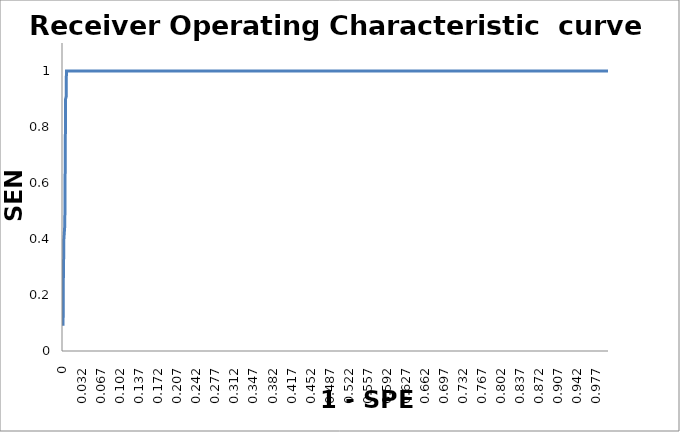
| Category | SEN |
|---|---|
| 0.0 | 0.09 |
| 0.0 | 0.18 |
| 0.0 | 0.27 |
| 0.0 | 0.3 |
| 0.0 | 0.36 |
| 0.0010000000000000009 | 0.4 |
| 0.0010000000000000009 | 0.4 |
| 0.0010000000000000009 | 0.4 |
| 0.0010000000000000009 | 0.4 |
| 0.0020000000000000018 | 0.4 |
| 0.0020000000000000018 | 0.4 |
| 0.0020000000000000018 | 0.45 |
| 0.0020000000000000018 | 0.55 |
| 0.0020000000000000018 | 0.64 |
| 0.0020000000000000018 | 0.73 |
| 0.0020000000000000018 | 0.82 |
| 0.0020000000000000018 | 0.9 |
| 0.0030000000000000027 | 0.9 |
| 0.0030000000000000027 | 0.9 |
| 0.0030000000000000027 | 0.9 |
| 0.0030000000000000027 | 0.91 |
| 0.0030000000000000027 | 1 |
| 0.0040000000000000036 | 1 |
| 0.0040000000000000036 | 1 |
| 0.0040000000000000036 | 1 |
| 0.0050000000000000044 | 1 |
| 0.0050000000000000044 | 1 |
| 0.0050000000000000044 | 1 |
| 0.006000000000000005 | 1 |
| 0.006000000000000005 | 1 |
| 0.006000000000000005 | 1 |
| 0.006000000000000005 | 1 |
| 0.007000000000000006 | 1 |
| 0.007000000000000006 | 1 |
| 0.007000000000000006 | 1 |
| 0.008000000000000007 | 1 |
| 0.008000000000000007 | 1 |
| 0.008000000000000007 | 1 |
| 0.008000000000000007 | 1 |
| 0.009000000000000008 | 1 |
| 0.009000000000000008 | 1 |
| 0.009000000000000008 | 1 |
| 0.010000000000000009 | 1 |
| 0.010000000000000009 | 1 |
| 0.010000000000000009 | 1 |
| 0.010000000000000009 | 1 |
| 0.01100000000000001 | 1 |
| 0.01100000000000001 | 1 |
| 0.01100000000000001 | 1 |
| 0.01200000000000001 | 1 |
| 0.01200000000000001 | 1 |
| 0.01200000000000001 | 1 |
| 0.013000000000000012 | 1 |
| 0.013000000000000012 | 1 |
| 0.013000000000000012 | 1 |
| 0.013000000000000012 | 1 |
| 0.014000000000000012 | 1 |
| 0.014000000000000012 | 1 |
| 0.014000000000000012 | 1 |
| 0.015000000000000013 | 1 |
| 0.015000000000000013 | 1 |
| 0.015000000000000013 | 1 |
| 0.015000000000000013 | 1 |
| 0.016000000000000014 | 1 |
| 0.016000000000000014 | 1 |
| 0.016000000000000014 | 1 |
| 0.017000000000000015 | 1 |
| 0.017000000000000015 | 1 |
| 0.017000000000000015 | 1 |
| 0.017000000000000015 | 1 |
| 0.018000000000000016 | 1 |
| 0.018000000000000016 | 1 |
| 0.018000000000000016 | 1 |
| 0.019000000000000017 | 1 |
| 0.019000000000000017 | 1 |
| 0.019000000000000017 | 1 |
| 0.020000000000000018 | 1 |
| 0.020000000000000018 | 1 |
| 0.020000000000000018 | 1 |
| 0.020000000000000018 | 1 |
| 0.02100000000000002 | 1 |
| 0.02100000000000002 | 1 |
| 0.02100000000000002 | 1 |
| 0.02200000000000002 | 1 |
| 0.02200000000000002 | 1 |
| 0.02200000000000002 | 1 |
| 0.02200000000000002 | 1 |
| 0.02300000000000002 | 1 |
| 0.02300000000000002 | 1 |
| 0.02300000000000002 | 1 |
| 0.02400000000000002 | 1 |
| 0.02400000000000002 | 1 |
| 0.02400000000000002 | 1 |
| 0.02400000000000002 | 1 |
| 0.025000000000000022 | 1 |
| 0.025000000000000022 | 1 |
| 0.025000000000000022 | 1 |
| 0.026000000000000023 | 1 |
| 0.026000000000000023 | 1 |
| 0.026000000000000023 | 1 |
| 0.027000000000000024 | 1 |
| 0.027000000000000024 | 1 |
| 0.027000000000000024 | 1 |
| 0.027000000000000024 | 1 |
| 0.028000000000000025 | 1 |
| 0.028000000000000025 | 1 |
| 0.028000000000000025 | 1 |
| 0.029000000000000026 | 1 |
| 0.029000000000000026 | 1 |
| 0.029000000000000026 | 1 |
| 0.029000000000000026 | 1 |
| 0.030000000000000027 | 1 |
| 0.030000000000000027 | 1 |
| 0.030000000000000027 | 1 |
| 0.031000000000000028 | 1 |
| 0.031000000000000028 | 1 |
| 0.031000000000000028 | 1 |
| 0.031000000000000028 | 1 |
| 0.03200000000000003 | 1 |
| 0.03200000000000003 | 1 |
| 0.03200000000000003 | 1 |
| 0.03300000000000003 | 1 |
| 0.03300000000000003 | 1 |
| 0.03300000000000003 | 1 |
| 0.03400000000000003 | 1 |
| 0.03400000000000003 | 1 |
| 0.03400000000000003 | 1 |
| 0.03400000000000003 | 1 |
| 0.03500000000000003 | 1 |
| 0.03500000000000003 | 1 |
| 0.03500000000000003 | 1 |
| 0.03600000000000003 | 1 |
| 0.03600000000000003 | 1 |
| 0.03600000000000003 | 1 |
| 0.03600000000000003 | 1 |
| 0.03700000000000003 | 1 |
| 0.03700000000000003 | 1 |
| 0.03700000000000003 | 1 |
| 0.038000000000000034 | 1 |
| 0.038000000000000034 | 1 |
| 0.038000000000000034 | 1 |
| 0.038000000000000034 | 1 |
| 0.039000000000000035 | 1 |
| 0.039000000000000035 | 1 |
| 0.039000000000000035 | 1 |
| 0.040000000000000036 | 1 |
| 0.040000000000000036 | 1 |
| 0.040000000000000036 | 1 |
| 0.041000000000000036 | 1 |
| 0.041000000000000036 | 1 |
| 0.041000000000000036 | 1 |
| 0.041000000000000036 | 1 |
| 0.04200000000000004 | 1 |
| 0.04200000000000004 | 1 |
| 0.04200000000000004 | 1 |
| 0.04300000000000004 | 1 |
| 0.04300000000000004 | 1 |
| 0.04300000000000004 | 1 |
| 0.04300000000000004 | 1 |
| 0.04400000000000004 | 1 |
| 0.04400000000000004 | 1 |
| 0.04400000000000004 | 1 |
| 0.04500000000000004 | 1 |
| 0.04500000000000004 | 1 |
| 0.04500000000000004 | 1 |
| 0.04500000000000004 | 1 |
| 0.04600000000000004 | 1 |
| 0.04600000000000004 | 1 |
| 0.04600000000000004 | 1 |
| 0.04700000000000004 | 1 |
| 0.04700000000000004 | 1 |
| 0.04700000000000004 | 1 |
| 0.04800000000000004 | 1 |
| 0.04800000000000004 | 1 |
| 0.04800000000000004 | 1 |
| 0.04800000000000004 | 1 |
| 0.049000000000000044 | 1 |
| 0.049000000000000044 | 1 |
| 0.049000000000000044 | 1 |
| 0.050000000000000044 | 1 |
| 0.050000000000000044 | 1 |
| 0.050000000000000044 | 1 |
| 0.050000000000000044 | 1 |
| 0.051000000000000045 | 1 |
| 0.051000000000000045 | 1 |
| 0.051000000000000045 | 1 |
| 0.052000000000000046 | 1 |
| 0.052000000000000046 | 1 |
| 0.052000000000000046 | 1 |
| 0.052000000000000046 | 1 |
| 0.05300000000000005 | 1 |
| 0.05300000000000005 | 1 |
| 0.05300000000000005 | 1 |
| 0.05400000000000005 | 1 |
| 0.05400000000000005 | 1 |
| 0.05400000000000005 | 1 |
| 0.05500000000000005 | 1 |
| 0.05500000000000005 | 1 |
| 0.05500000000000005 | 1 |
| 0.05500000000000005 | 1 |
| 0.05600000000000005 | 1 |
| 0.05600000000000005 | 1 |
| 0.05600000000000005 | 1 |
| 0.05700000000000005 | 1 |
| 0.05700000000000005 | 1 |
| 0.05700000000000005 | 1 |
| 0.05700000000000005 | 1 |
| 0.05800000000000005 | 1 |
| 0.05800000000000005 | 1 |
| 0.05800000000000005 | 1 |
| 0.05900000000000005 | 1 |
| 0.05900000000000005 | 1 |
| 0.05900000000000005 | 1 |
| 0.05900000000000005 | 1 |
| 0.06000000000000005 | 1 |
| 0.06000000000000005 | 1 |
| 0.06000000000000005 | 1 |
| 0.061000000000000054 | 1 |
| 0.061000000000000054 | 1 |
| 0.061000000000000054 | 1 |
| 0.061000000000000054 | 1 |
| 0.062000000000000055 | 1 |
| 0.062000000000000055 | 1 |
| 0.062000000000000055 | 1 |
| 0.06299999999999994 | 1 |
| 0.06299999999999994 | 1 |
| 0.06299999999999994 | 1 |
| 0.06399999999999995 | 1 |
| 0.06399999999999995 | 1 |
| 0.06399999999999995 | 1 |
| 0.06399999999999995 | 1 |
| 0.06499999999999995 | 1 |
| 0.06499999999999995 | 1 |
| 0.06499999999999995 | 1 |
| 0.06599999999999995 | 1 |
| 0.06599999999999995 | 1 |
| 0.06599999999999995 | 1 |
| 0.06599999999999995 | 1 |
| 0.06699999999999995 | 1 |
| 0.06699999999999995 | 1 |
| 0.06699999999999995 | 1 |
| 0.06799999999999995 | 1 |
| 0.06799999999999995 | 1 |
| 0.06799999999999995 | 1 |
| 0.06799999999999995 | 1 |
| 0.06899999999999995 | 1 |
| 0.06899999999999995 | 1 |
| 0.06899999999999995 | 1 |
| 0.06999999999999995 | 1 |
| 0.06999999999999995 | 1 |
| 0.06999999999999995 | 1 |
| 0.07099999999999995 | 1 |
| 0.07099999999999995 | 1 |
| 0.07099999999999995 | 1 |
| 0.07099999999999995 | 1 |
| 0.07199999999999995 | 1 |
| 0.07199999999999995 | 1 |
| 0.07199999999999995 | 1 |
| 0.07299999999999995 | 1 |
| 0.07299999999999995 | 1 |
| 0.07299999999999995 | 1 |
| 0.07299999999999995 | 1 |
| 0.07399999999999995 | 1 |
| 0.07399999999999995 | 1 |
| 0.07399999999999995 | 1 |
| 0.07499999999999996 | 1 |
| 0.07499999999999996 | 1 |
| 0.07499999999999996 | 1 |
| 0.07499999999999996 | 1 |
| 0.07599999999999996 | 1 |
| 0.07599999999999996 | 1 |
| 0.07599999999999996 | 1 |
| 0.07699999999999996 | 1 |
| 0.07699999999999996 | 1 |
| 0.07699999999999996 | 1 |
| 0.07799999999999996 | 1 |
| 0.07799999999999996 | 1 |
| 0.07799999999999996 | 1 |
| 0.07799999999999996 | 1 |
| 0.07899999999999996 | 1 |
| 0.07899999999999996 | 1 |
| 0.07899999999999996 | 1 |
| 0.07999999999999996 | 1 |
| 0.07999999999999996 | 1 |
| 0.07999999999999996 | 1 |
| 0.07999999999999996 | 1 |
| 0.08099999999999996 | 1 |
| 0.08099999999999996 | 1 |
| 0.08099999999999996 | 1 |
| 0.08199999999999996 | 1 |
| 0.08199999999999996 | 1 |
| 0.08199999999999996 | 1 |
| 0.08199999999999996 | 1 |
| 0.08299999999999996 | 1 |
| 0.08299999999999996 | 1 |
| 0.08299999999999996 | 1 |
| 0.08399999999999996 | 1 |
| 0.08399999999999996 | 1 |
| 0.08399999999999996 | 1 |
| 0.08499999999999996 | 1 |
| 0.08499999999999996 | 1 |
| 0.08499999999999996 | 1 |
| 0.08499999999999996 | 1 |
| 0.08599999999999997 | 1 |
| 0.08599999999999997 | 1 |
| 0.08599999999999997 | 1 |
| 0.08699999999999997 | 1 |
| 0.08699999999999997 | 1 |
| 0.08699999999999997 | 1 |
| 0.08699999999999997 | 1 |
| 0.08799999999999997 | 1 |
| 0.08799999999999997 | 1 |
| 0.08799999999999997 | 1 |
| 0.08899999999999997 | 1 |
| 0.08899999999999997 | 1 |
| 0.08899999999999997 | 1 |
| 0.08899999999999997 | 1 |
| 0.08999999999999997 | 1 |
| 0.08999999999999997 | 1 |
| 0.08999999999999997 | 1 |
| 0.09099999999999997 | 1 |
| 0.09099999999999997 | 1 |
| 0.09099999999999997 | 1 |
| 0.09199999999999997 | 1 |
| 0.09199999999999997 | 1 |
| 0.09199999999999997 | 1 |
| 0.09199999999999997 | 1 |
| 0.09299999999999997 | 1 |
| 0.09299999999999997 | 1 |
| 0.09299999999999997 | 1 |
| 0.09399999999999997 | 1 |
| 0.09399999999999997 | 1 |
| 0.09399999999999997 | 1 |
| 0.09399999999999997 | 1 |
| 0.09499999999999997 | 1 |
| 0.09499999999999997 | 1 |
| 0.09499999999999997 | 1 |
| 0.09599999999999997 | 1 |
| 0.09599999999999997 | 1 |
| 0.09599999999999997 | 1 |
| 0.09599999999999997 | 1 |
| 0.09699999999999998 | 1 |
| 0.09699999999999998 | 1 |
| 0.09699999999999998 | 1 |
| 0.09799999999999998 | 1 |
| 0.09799999999999998 | 1 |
| 0.09799999999999998 | 1 |
| 0.09899999999999998 | 1 |
| 0.09899999999999998 | 1 |
| 0.09899999999999998 | 1 |
| 0.09899999999999998 | 1 |
| 0.09999999999999998 | 1 |
| 0.09999999999999998 | 1 |
| 0.09999999999999998 | 1 |
| 0.10099999999999998 | 1 |
| 0.10099999999999998 | 1 |
| 0.10099999999999998 | 1 |
| 0.10099999999999998 | 1 |
| 0.10199999999999998 | 1 |
| 0.10199999999999998 | 1 |
| 0.10199999999999998 | 1 |
| 0.10299999999999998 | 1 |
| 0.10299999999999998 | 1 |
| 0.10299999999999998 | 1 |
| 0.10299999999999998 | 1 |
| 0.10399999999999998 | 1 |
| 0.10399999999999998 | 1 |
| 0.10399999999999998 | 1 |
| 0.10499999999999998 | 1 |
| 0.10499999999999998 | 1 |
| 0.10499999999999998 | 1 |
| 0.10599999999999998 | 1 |
| 0.10599999999999998 | 1 |
| 0.10599999999999998 | 1 |
| 0.10599999999999998 | 1 |
| 0.10699999999999998 | 1 |
| 0.10699999999999998 | 1 |
| 0.10699999999999998 | 1 |
| 0.10799999999999998 | 1 |
| 0.10799999999999998 | 1 |
| 0.10799999999999998 | 1 |
| 0.10799999999999998 | 1 |
| 0.10899999999999999 | 1 |
| 0.10899999999999999 | 1 |
| 0.10899999999999999 | 1 |
| 0.10999999999999999 | 1 |
| 0.10999999999999999 | 1 |
| 0.10999999999999999 | 1 |
| 0.10999999999999999 | 1 |
| 0.11099999999999999 | 1 |
| 0.11099999999999999 | 1 |
| 0.11099999999999999 | 1 |
| 0.11199999999999999 | 1 |
| 0.11199999999999999 | 1 |
| 0.11199999999999999 | 1 |
| 0.11299999999999999 | 1 |
| 0.11299999999999999 | 1 |
| 0.11299999999999999 | 1 |
| 0.11299999999999999 | 1 |
| 0.11399999999999999 | 1 |
| 0.11399999999999999 | 1 |
| 0.11399999999999999 | 1 |
| 0.11499999999999999 | 1 |
| 0.11499999999999999 | 1 |
| 0.11499999999999999 | 1 |
| 0.11499999999999999 | 1 |
| 0.11599999999999999 | 1 |
| 0.11599999999999999 | 1 |
| 0.11599999999999999 | 1 |
| 0.11699999999999999 | 1 |
| 0.11699999999999999 | 1 |
| 0.11699999999999999 | 1 |
| 0.11699999999999999 | 1 |
| 0.118 | 1 |
| 0.118 | 1 |
| 0.118 | 1 |
| 0.119 | 1 |
| 0.119 | 1 |
| 0.119 | 1 |
| 0.119 | 1 |
| 0.12 | 1 |
| 0.12 | 1 |
| 0.12 | 1 |
| 0.121 | 1 |
| 0.121 | 1 |
| 0.121 | 1 |
| 0.122 | 1 |
| 0.122 | 1 |
| 0.122 | 1 |
| 0.122 | 1 |
| 0.123 | 1 |
| 0.123 | 1 |
| 0.123 | 1 |
| 0.124 | 1 |
| 0.124 | 1 |
| 0.124 | 1 |
| 0.124 | 1 |
| 0.125 | 1 |
| 0.125 | 1 |
| 0.125 | 1 |
| 0.126 | 1 |
| 0.126 | 1 |
| 0.126 | 1 |
| 0.126 | 1 |
| 0.127 | 1 |
| 0.127 | 1 |
| 0.127 | 1 |
| 0.128 | 1 |
| 0.128 | 1 |
| 0.128 | 1 |
| 0.129 | 1 |
| 0.129 | 1 |
| 0.129 | 1 |
| 0.129 | 1 |
| 0.13 | 1 |
| 0.13 | 1 |
| 0.13 | 1 |
| 0.131 | 1 |
| 0.131 | 1 |
| 0.131 | 1 |
| 0.131 | 1 |
| 0.132 | 1 |
| 0.132 | 1 |
| 0.132 | 1 |
| 0.133 | 1 |
| 0.133 | 1 |
| 0.133 | 1 |
| 0.133 | 1 |
| 0.134 | 1 |
| 0.134 | 1 |
| 0.134 | 1 |
| 0.135 | 1 |
| 0.135 | 1 |
| 0.135 | 1 |
| 0.136 | 1 |
| 0.136 | 1 |
| 0.136 | 1 |
| 0.136 | 1 |
| 0.137 | 1 |
| 0.137 | 1 |
| 0.137 | 1 |
| 0.138 | 1 |
| 0.138 | 1 |
| 0.138 | 1 |
| 0.138 | 1 |
| 0.139 | 1 |
| 0.139 | 1 |
| 0.139 | 1 |
| 0.14 | 1 |
| 0.14 | 1 |
| 0.14 | 1 |
| 0.14 | 1 |
| 0.14100000000000001 | 1 |
| 0.14100000000000001 | 1 |
| 0.14100000000000001 | 1 |
| 0.14200000000000002 | 1 |
| 0.14200000000000002 | 1 |
| 0.14200000000000002 | 1 |
| 0.14300000000000002 | 1 |
| 0.14300000000000002 | 1 |
| 0.14300000000000002 | 1 |
| 0.14300000000000002 | 1 |
| 0.14400000000000002 | 1 |
| 0.14400000000000002 | 1 |
| 0.14400000000000002 | 1 |
| 0.14500000000000002 | 1 |
| 0.14500000000000002 | 1 |
| 0.14500000000000002 | 1 |
| 0.14500000000000002 | 1 |
| 0.14600000000000002 | 1 |
| 0.14600000000000002 | 1 |
| 0.14600000000000002 | 1 |
| 0.14700000000000002 | 1 |
| 0.14700000000000002 | 1 |
| 0.14700000000000002 | 1 |
| 0.14700000000000002 | 1 |
| 0.14800000000000002 | 1 |
| 0.14800000000000002 | 1 |
| 0.14800000000000002 | 1 |
| 0.14900000000000002 | 1 |
| 0.14900000000000002 | 1 |
| 0.14900000000000002 | 1 |
| 0.15000000000000002 | 1 |
| 0.15000000000000002 | 1 |
| 0.15000000000000002 | 1 |
| 0.15000000000000002 | 1 |
| 0.15100000000000002 | 1 |
| 0.15100000000000002 | 1 |
| 0.15100000000000002 | 1 |
| 0.15200000000000002 | 1 |
| 0.15200000000000002 | 1 |
| 0.15200000000000002 | 1 |
| 0.15200000000000002 | 1 |
| 0.15300000000000002 | 1 |
| 0.15300000000000002 | 1 |
| 0.15300000000000002 | 1 |
| 0.15400000000000003 | 1 |
| 0.15400000000000003 | 1 |
| 0.15400000000000003 | 1 |
| 0.15400000000000003 | 1 |
| 0.15500000000000003 | 1 |
| 0.15500000000000003 | 1 |
| 0.15500000000000003 | 1 |
| 0.15600000000000003 | 1 |
| 0.15600000000000003 | 1 |
| 0.15600000000000003 | 1 |
| 0.15700000000000003 | 1 |
| 0.15700000000000003 | 1 |
| 0.15700000000000003 | 1 |
| 0.15700000000000003 | 1 |
| 0.15800000000000003 | 1 |
| 0.15800000000000003 | 1 |
| 0.15800000000000003 | 1 |
| 0.15900000000000003 | 1 |
| 0.15900000000000003 | 1 |
| 0.15900000000000003 | 1 |
| 0.15900000000000003 | 1 |
| 0.16000000000000003 | 1 |
| 0.16000000000000003 | 1 |
| 0.16000000000000003 | 1 |
| 0.16100000000000003 | 1 |
| 0.16100000000000003 | 1 |
| 0.16100000000000003 | 1 |
| 0.16100000000000003 | 1 |
| 0.16200000000000003 | 1 |
| 0.16200000000000003 | 1 |
| 0.16200000000000003 | 1 |
| 0.16300000000000003 | 1 |
| 0.16300000000000003 | 1 |
| 0.16300000000000003 | 1 |
| 0.16400000000000003 | 1 |
| 0.16400000000000003 | 1 |
| 0.16400000000000003 | 1 |
| 0.16400000000000003 | 1 |
| 0.16500000000000004 | 1 |
| 0.16500000000000004 | 1 |
| 0.16500000000000004 | 1 |
| 0.16600000000000004 | 1 |
| 0.16600000000000004 | 1 |
| 0.16600000000000004 | 1 |
| 0.16600000000000004 | 1 |
| 0.16700000000000004 | 1 |
| 0.16700000000000004 | 1 |
| 0.16700000000000004 | 1 |
| 0.16800000000000004 | 1 |
| 0.16800000000000004 | 1 |
| 0.16800000000000004 | 1 |
| 0.16800000000000004 | 1 |
| 0.16900000000000004 | 1 |
| 0.16900000000000004 | 1 |
| 0.16900000000000004 | 1 |
| 0.17000000000000004 | 1 |
| 0.17000000000000004 | 1 |
| 0.17000000000000004 | 1 |
| 0.17100000000000004 | 1 |
| 0.17100000000000004 | 1 |
| 0.17100000000000004 | 1 |
| 0.17100000000000004 | 1 |
| 0.17200000000000004 | 1 |
| 0.17200000000000004 | 1 |
| 0.17200000000000004 | 1 |
| 0.17300000000000004 | 1 |
| 0.17300000000000004 | 1 |
| 0.17300000000000004 | 1 |
| 0.17300000000000004 | 1 |
| 0.17400000000000004 | 1 |
| 0.17400000000000004 | 1 |
| 0.17400000000000004 | 1 |
| 0.17500000000000004 | 1 |
| 0.17500000000000004 | 1 |
| 0.17500000000000004 | 1 |
| 0.17500000000000004 | 1 |
| 0.17600000000000005 | 1 |
| 0.17600000000000005 | 1 |
| 0.17600000000000005 | 1 |
| 0.17700000000000005 | 1 |
| 0.17700000000000005 | 1 |
| 0.17700000000000005 | 1 |
| 0.17700000000000005 | 1 |
| 0.17800000000000005 | 1 |
| 0.17800000000000005 | 1 |
| 0.17800000000000005 | 1 |
| 0.17900000000000005 | 1 |
| 0.17900000000000005 | 1 |
| 0.17900000000000005 | 1 |
| 0.18000000000000005 | 1 |
| 0.18000000000000005 | 1 |
| 0.18000000000000005 | 1 |
| 0.18000000000000005 | 1 |
| 0.18100000000000005 | 1 |
| 0.18100000000000005 | 1 |
| 0.18100000000000005 | 1 |
| 0.18200000000000005 | 1 |
| 0.18200000000000005 | 1 |
| 0.18200000000000005 | 1 |
| 0.18200000000000005 | 1 |
| 0.18300000000000005 | 1 |
| 0.18300000000000005 | 1 |
| 0.18300000000000005 | 1 |
| 0.18400000000000005 | 1 |
| 0.18400000000000005 | 1 |
| 0.18400000000000005 | 1 |
| 0.18400000000000005 | 1 |
| 0.18500000000000005 | 1 |
| 0.18500000000000005 | 1 |
| 0.18500000000000005 | 1 |
| 0.18600000000000005 | 1 |
| 0.18600000000000005 | 1 |
| 0.18600000000000005 | 1 |
| 0.18700000000000006 | 1 |
| 0.18700000000000006 | 1 |
| 0.18700000000000006 | 1 |
| 0.18700000000000006 | 1 |
| 0.18799999999999994 | 1 |
| 0.18799999999999994 | 1 |
| 0.18799999999999994 | 1 |
| 0.18899999999999995 | 1 |
| 0.18899999999999995 | 1 |
| 0.18899999999999995 | 1 |
| 0.18899999999999995 | 1 |
| 0.18999999999999995 | 1 |
| 0.18999999999999995 | 1 |
| 0.18999999999999995 | 1 |
| 0.19099999999999995 | 1 |
| 0.19099999999999995 | 1 |
| 0.19099999999999995 | 1 |
| 0.19099999999999995 | 1 |
| 0.19199999999999995 | 1 |
| 0.19199999999999995 | 1 |
| 0.19199999999999995 | 1 |
| 0.19299999999999995 | 1 |
| 0.19299999999999995 | 1 |
| 0.19299999999999995 | 1 |
| 0.19399999999999995 | 1 |
| 0.19399999999999995 | 1 |
| 0.19399999999999995 | 1 |
| 0.19399999999999995 | 1 |
| 0.19499999999999995 | 1 |
| 0.19499999999999995 | 1 |
| 0.19499999999999995 | 1 |
| 0.19599999999999995 | 1 |
| 0.19599999999999995 | 1 |
| 0.19599999999999995 | 1 |
| 0.19599999999999995 | 1 |
| 0.19699999999999995 | 1 |
| 0.19699999999999995 | 1 |
| 0.19699999999999995 | 1 |
| 0.19799999999999995 | 1 |
| 0.19799999999999995 | 1 |
| 0.19799999999999995 | 1 |
| 0.19799999999999995 | 1 |
| 0.19899999999999995 | 1 |
| 0.19899999999999995 | 1 |
| 0.19899999999999995 | 1 |
| 0.19999999999999996 | 1 |
| 0.19999999999999996 | 1 |
| 0.19999999999999996 | 1 |
| 0.20099999999999996 | 1 |
| 0.20099999999999996 | 1 |
| 0.20099999999999996 | 1 |
| 0.20099999999999996 | 1 |
| 0.20199999999999996 | 1 |
| 0.20199999999999996 | 1 |
| 0.20199999999999996 | 1 |
| 0.20299999999999996 | 1 |
| 0.20299999999999996 | 1 |
| 0.20299999999999996 | 1 |
| 0.20299999999999996 | 1 |
| 0.20399999999999996 | 1 |
| 0.20399999999999996 | 1 |
| 0.20399999999999996 | 1 |
| 0.20499999999999996 | 1 |
| 0.20499999999999996 | 1 |
| 0.20499999999999996 | 1 |
| 0.20499999999999996 | 1 |
| 0.20599999999999996 | 1 |
| 0.20599999999999996 | 1 |
| 0.20599999999999996 | 1 |
| 0.20699999999999996 | 1 |
| 0.20699999999999996 | 1 |
| 0.20699999999999996 | 1 |
| 0.20799999999999996 | 1 |
| 0.20799999999999996 | 1 |
| 0.20799999999999996 | 1 |
| 0.20799999999999996 | 1 |
| 0.20899999999999996 | 1 |
| 0.20899999999999996 | 1 |
| 0.20899999999999996 | 1 |
| 0.20999999999999996 | 1 |
| 0.20999999999999996 | 1 |
| 0.20999999999999996 | 1 |
| 0.20999999999999996 | 1 |
| 0.21099999999999997 | 1 |
| 0.21099999999999997 | 1 |
| 0.21099999999999997 | 1 |
| 0.21199999999999997 | 1 |
| 0.21199999999999997 | 1 |
| 0.21199999999999997 | 1 |
| 0.21199999999999997 | 1 |
| 0.21299999999999997 | 1 |
| 0.21299999999999997 | 1 |
| 0.21299999999999997 | 1 |
| 0.21399999999999997 | 1 |
| 0.21399999999999997 | 1 |
| 0.21399999999999997 | 1 |
| 0.21499999999999997 | 1 |
| 0.21499999999999997 | 1 |
| 0.21499999999999997 | 1 |
| 0.21499999999999997 | 1 |
| 0.21599999999999997 | 1 |
| 0.21599999999999997 | 1 |
| 0.21599999999999997 | 1 |
| 0.21699999999999997 | 1 |
| 0.21699999999999997 | 1 |
| 0.21699999999999997 | 1 |
| 0.21699999999999997 | 1 |
| 0.21799999999999997 | 1 |
| 0.21799999999999997 | 1 |
| 0.21799999999999997 | 1 |
| 0.21899999999999997 | 1 |
| 0.21899999999999997 | 1 |
| 0.21899999999999997 | 1 |
| 0.21899999999999997 | 1 |
| 0.21999999999999997 | 1 |
| 0.21999999999999997 | 1 |
| 0.21999999999999997 | 1 |
| 0.22099999999999997 | 1 |
| 0.22099999999999997 | 1 |
| 0.22099999999999997 | 1 |
| 0.22199999999999998 | 1 |
| 0.22199999999999998 | 1 |
| 0.22199999999999998 | 1 |
| 0.22199999999999998 | 1 |
| 0.22299999999999998 | 1 |
| 0.22299999999999998 | 1 |
| 0.22299999999999998 | 1 |
| 0.22399999999999998 | 1 |
| 0.22399999999999998 | 1 |
| 0.22399999999999998 | 1 |
| 0.22399999999999998 | 1 |
| 0.22499999999999998 | 1 |
| 0.22499999999999998 | 1 |
| 0.22499999999999998 | 1 |
| 0.22599999999999998 | 1 |
| 0.22599999999999998 | 1 |
| 0.22599999999999998 | 1 |
| 0.22599999999999998 | 1 |
| 0.22699999999999998 | 1 |
| 0.22699999999999998 | 1 |
| 0.22699999999999998 | 1 |
| 0.22799999999999998 | 1 |
| 0.22799999999999998 | 1 |
| 0.22799999999999998 | 1 |
| 0.22899999999999998 | 1 |
| 0.22899999999999998 | 1 |
| 0.22899999999999998 | 1 |
| 0.22899999999999998 | 1 |
| 0.22999999999999998 | 1 |
| 0.22999999999999998 | 1 |
| 0.22999999999999998 | 1 |
| 0.23099999999999998 | 1 |
| 0.23099999999999998 | 1 |
| 0.23099999999999998 | 1 |
| 0.23099999999999998 | 1 |
| 0.23199999999999998 | 1 |
| 0.23199999999999998 | 1 |
| 0.23199999999999998 | 1 |
| 0.23299999999999998 | 1 |
| 0.23299999999999998 | 1 |
| 0.23299999999999998 | 1 |
| 0.23299999999999998 | 1 |
| 0.23399999999999999 | 1 |
| 0.23399999999999999 | 1 |
| 0.23399999999999999 | 1 |
| 0.235 | 1 |
| 0.235 | 1 |
| 0.235 | 1 |
| 0.235 | 1 |
| 0.236 | 1 |
| 0.236 | 1 |
| 0.236 | 1 |
| 0.237 | 1 |
| 0.237 | 1 |
| 0.237 | 1 |
| 0.238 | 1 |
| 0.238 | 1 |
| 0.238 | 1 |
| 0.238 | 1 |
| 0.239 | 1 |
| 0.239 | 1 |
| 0.239 | 1 |
| 0.24 | 1 |
| 0.24 | 1 |
| 0.24 | 1 |
| 0.24 | 1 |
| 0.241 | 1 |
| 0.241 | 1 |
| 0.241 | 1 |
| 0.242 | 1 |
| 0.242 | 1 |
| 0.242 | 1 |
| 0.242 | 1 |
| 0.243 | 1 |
| 0.243 | 1 |
| 0.243 | 1 |
| 0.244 | 1 |
| 0.244 | 1 |
| 0.244 | 1 |
| 0.245 | 1 |
| 0.245 | 1 |
| 0.245 | 1 |
| 0.245 | 1 |
| 0.246 | 1 |
| 0.246 | 1 |
| 0.246 | 1 |
| 0.247 | 1 |
| 0.247 | 1 |
| 0.247 | 1 |
| 0.247 | 1 |
| 0.248 | 1 |
| 0.248 | 1 |
| 0.248 | 1 |
| 0.249 | 1 |
| 0.249 | 1 |
| 0.249 | 1 |
| 0.249 | 1 |
| 0.25 | 1 |
| 0.25 | 1 |
| 0.25 | 1 |
| 0.251 | 1 |
| 0.251 | 1 |
| 0.251 | 1 |
| 0.252 | 1 |
| 0.252 | 1 |
| 0.252 | 1 |
| 0.252 | 1 |
| 0.253 | 1 |
| 0.253 | 1 |
| 0.253 | 1 |
| 0.254 | 1 |
| 0.254 | 1 |
| 0.254 | 1 |
| 0.254 | 1 |
| 0.255 | 1 |
| 0.255 | 1 |
| 0.255 | 1 |
| 0.256 | 1 |
| 0.256 | 1 |
| 0.256 | 1 |
| 0.256 | 1 |
| 0.257 | 1 |
| 0.257 | 1 |
| 0.257 | 1 |
| 0.258 | 1 |
| 0.258 | 1 |
| 0.258 | 1 |
| 0.259 | 1 |
| 0.259 | 1 |
| 0.259 | 1 |
| 0.259 | 1 |
| 0.26 | 1 |
| 0.26 | 1 |
| 0.26 | 1 |
| 0.261 | 1 |
| 0.261 | 1 |
| 0.261 | 1 |
| 0.261 | 1 |
| 0.262 | 1 |
| 0.262 | 1 |
| 0.262 | 1 |
| 0.263 | 1 |
| 0.263 | 1 |
| 0.263 | 1 |
| 0.263 | 1 |
| 0.264 | 1 |
| 0.264 | 1 |
| 0.264 | 1 |
| 0.265 | 1 |
| 0.265 | 1 |
| 0.265 | 1 |
| 0.266 | 1 |
| 0.266 | 1 |
| 0.266 | 1 |
| 0.266 | 1 |
| 0.267 | 1 |
| 0.267 | 1 |
| 0.267 | 1 |
| 0.268 | 1 |
| 0.268 | 1 |
| 0.268 | 1 |
| 0.268 | 1 |
| 0.269 | 1 |
| 0.269 | 1 |
| 0.269 | 1 |
| 0.27 | 1 |
| 0.27 | 1 |
| 0.27 | 1 |
| 0.27 | 1 |
| 0.271 | 1 |
| 0.271 | 1 |
| 0.271 | 1 |
| 0.272 | 1 |
| 0.272 | 1 |
| 0.272 | 1 |
| 0.273 | 1 |
| 0.273 | 1 |
| 0.273 | 1 |
| 0.273 | 1 |
| 0.274 | 1 |
| 0.274 | 1 |
| 0.274 | 1 |
| 0.275 | 1 |
| 0.275 | 1 |
| 0.275 | 1 |
| 0.275 | 1 |
| 0.276 | 1 |
| 0.276 | 1 |
| 0.276 | 1 |
| 0.277 | 1 |
| 0.277 | 1 |
| 0.277 | 1 |
| 0.277 | 1 |
| 0.278 | 1 |
| 0.278 | 1 |
| 0.278 | 1 |
| 0.279 | 1 |
| 0.279 | 1 |
| 0.279 | 1 |
| 0.28 | 1 |
| 0.28 | 1 |
| 0.28 | 1 |
| 0.28 | 1 |
| 0.281 | 1 |
| 0.281 | 1 |
| 0.281 | 1 |
| 0.28200000000000003 | 1 |
| 0.28200000000000003 | 1 |
| 0.28200000000000003 | 1 |
| 0.28200000000000003 | 1 |
| 0.28300000000000003 | 1 |
| 0.28300000000000003 | 1 |
| 0.28300000000000003 | 1 |
| 0.28400000000000003 | 1 |
| 0.28400000000000003 | 1 |
| 0.28400000000000003 | 1 |
| 0.28400000000000003 | 1 |
| 0.28500000000000003 | 1 |
| 0.28500000000000003 | 1 |
| 0.28500000000000003 | 1 |
| 0.28600000000000003 | 1 |
| 0.28600000000000003 | 1 |
| 0.28600000000000003 | 1 |
| 0.28700000000000003 | 1 |
| 0.28700000000000003 | 1 |
| 0.28700000000000003 | 1 |
| 0.28700000000000003 | 1 |
| 0.28800000000000003 | 1 |
| 0.28800000000000003 | 1 |
| 0.28800000000000003 | 1 |
| 0.28900000000000003 | 1 |
| 0.28900000000000003 | 1 |
| 0.28900000000000003 | 1 |
| 0.28900000000000003 | 1 |
| 0.29000000000000004 | 1 |
| 0.29000000000000004 | 1 |
| 0.29000000000000004 | 1 |
| 0.29100000000000004 | 1 |
| 0.29100000000000004 | 1 |
| 0.29100000000000004 | 1 |
| 0.29100000000000004 | 1 |
| 0.29200000000000004 | 1 |
| 0.29200000000000004 | 1 |
| 0.29200000000000004 | 1 |
| 0.29300000000000004 | 1 |
| 0.29300000000000004 | 1 |
| 0.29300000000000004 | 1 |
| 0.29400000000000004 | 1 |
| 0.29400000000000004 | 1 |
| 0.29400000000000004 | 1 |
| 0.29400000000000004 | 1 |
| 0.29500000000000004 | 1 |
| 0.29500000000000004 | 1 |
| 0.29500000000000004 | 1 |
| 0.29600000000000004 | 1 |
| 0.29600000000000004 | 1 |
| 0.29600000000000004 | 1 |
| 0.29600000000000004 | 1 |
| 0.29700000000000004 | 1 |
| 0.29700000000000004 | 1 |
| 0.29700000000000004 | 1 |
| 0.29800000000000004 | 1 |
| 0.29800000000000004 | 1 |
| 0.29800000000000004 | 1 |
| 0.29800000000000004 | 1 |
| 0.29900000000000004 | 1 |
| 0.29900000000000004 | 1 |
| 0.29900000000000004 | 1 |
| 0.30000000000000004 | 1 |
| 0.30000000000000004 | 1 |
| 0.30000000000000004 | 1 |
| 0.30000000000000004 | 1 |
| 0.30100000000000005 | 1 |
| 0.30100000000000005 | 1 |
| 0.30100000000000005 | 1 |
| 0.30200000000000005 | 1 |
| 0.30200000000000005 | 1 |
| 0.30200000000000005 | 1 |
| 0.30300000000000005 | 1 |
| 0.30300000000000005 | 1 |
| 0.30300000000000005 | 1 |
| 0.30300000000000005 | 1 |
| 0.30400000000000005 | 1 |
| 0.30400000000000005 | 1 |
| 0.30400000000000005 | 1 |
| 0.30500000000000005 | 1 |
| 0.30500000000000005 | 1 |
| 0.30500000000000005 | 1 |
| 0.30500000000000005 | 1 |
| 0.30600000000000005 | 1 |
| 0.30600000000000005 | 1 |
| 0.30600000000000005 | 1 |
| 0.30700000000000005 | 1 |
| 0.30700000000000005 | 1 |
| 0.30700000000000005 | 1 |
| 0.30700000000000005 | 1 |
| 0.30800000000000005 | 1 |
| 0.30800000000000005 | 1 |
| 0.30800000000000005 | 1 |
| 0.30900000000000005 | 1 |
| 0.30900000000000005 | 1 |
| 0.30900000000000005 | 1 |
| 0.31000000000000005 | 1 |
| 0.31000000000000005 | 1 |
| 0.31000000000000005 | 1 |
| 0.31000000000000005 | 1 |
| 0.31100000000000005 | 1 |
| 0.31100000000000005 | 1 |
| 0.31100000000000005 | 1 |
| 0.31200000000000006 | 1 |
| 0.31200000000000006 | 1 |
| 0.31200000000000006 | 1 |
| 0.31200000000000006 | 1 |
| 0.31299999999999994 | 1 |
| 0.31299999999999994 | 1 |
| 0.31299999999999994 | 1 |
| 0.31399999999999995 | 1 |
| 0.31399999999999995 | 1 |
| 0.31399999999999995 | 1 |
| 0.31399999999999995 | 1 |
| 0.31499999999999995 | 1 |
| 0.31499999999999995 | 1 |
| 0.31499999999999995 | 1 |
| 0.31599999999999995 | 1 |
| 0.31599999999999995 | 1 |
| 0.31599999999999995 | 1 |
| 0.31699999999999995 | 1 |
| 0.31699999999999995 | 1 |
| 0.31699999999999995 | 1 |
| 0.31699999999999995 | 1 |
| 0.31799999999999995 | 1 |
| 0.31799999999999995 | 1 |
| 0.31799999999999995 | 1 |
| 0.31899999999999995 | 1 |
| 0.31899999999999995 | 1 |
| 0.31899999999999995 | 1 |
| 0.31899999999999995 | 1 |
| 0.31999999999999995 | 1 |
| 0.31999999999999995 | 1 |
| 0.31999999999999995 | 1 |
| 0.32099999999999995 | 1 |
| 0.32099999999999995 | 1 |
| 0.32099999999999995 | 1 |
| 0.32099999999999995 | 1 |
| 0.32199999999999995 | 1 |
| 0.32199999999999995 | 1 |
| 0.32199999999999995 | 1 |
| 0.32299999999999995 | 1 |
| 0.32299999999999995 | 1 |
| 0.32299999999999995 | 1 |
| 0.32399999999999995 | 1 |
| 0.32399999999999995 | 1 |
| 0.32399999999999995 | 1 |
| 0.32399999999999995 | 1 |
| 0.32499999999999996 | 1 |
| 0.32499999999999996 | 1 |
| 0.32499999999999996 | 1 |
| 0.32599999999999996 | 1 |
| 0.32599999999999996 | 1 |
| 0.32599999999999996 | 1 |
| 0.32599999999999996 | 1 |
| 0.32699999999999996 | 1 |
| 0.32699999999999996 | 1 |
| 0.32699999999999996 | 1 |
| 0.32799999999999996 | 1 |
| 0.32799999999999996 | 1 |
| 0.32799999999999996 | 1 |
| 0.32799999999999996 | 1 |
| 0.32899999999999996 | 1 |
| 0.32899999999999996 | 1 |
| 0.32899999999999996 | 1 |
| 0.32999999999999996 | 1 |
| 0.32999999999999996 | 1 |
| 0.32999999999999996 | 1 |
| 0.33099999999999996 | 1 |
| 0.33099999999999996 | 1 |
| 0.33099999999999996 | 1 |
| 0.33099999999999996 | 1 |
| 0.33199999999999996 | 1 |
| 0.33199999999999996 | 1 |
| 0.33199999999999996 | 1 |
| 0.33299999999999996 | 1 |
| 0.33299999999999996 | 1 |
| 0.33299999999999996 | 1 |
| 0.33299999999999996 | 1 |
| 0.33399999999999996 | 1 |
| 0.33399999999999996 | 1 |
| 0.33399999999999996 | 1 |
| 0.33499999999999996 | 1 |
| 0.33499999999999996 | 1 |
| 0.33499999999999996 | 1 |
| 0.33499999999999996 | 1 |
| 0.33599999999999997 | 1 |
| 0.33599999999999997 | 1 |
| 0.33599999999999997 | 1 |
| 0.33699999999999997 | 1 |
| 0.33699999999999997 | 1 |
| 0.33699999999999997 | 1 |
| 0.33799999999999997 | 1 |
| 0.33799999999999997 | 1 |
| 0.33799999999999997 | 1 |
| 0.33799999999999997 | 1 |
| 0.33899999999999997 | 1 |
| 0.33899999999999997 | 1 |
| 0.33899999999999997 | 1 |
| 0.33999999999999997 | 1 |
| 0.33999999999999997 | 1 |
| 0.33999999999999997 | 1 |
| 0.33999999999999997 | 1 |
| 0.34099999999999997 | 1 |
| 0.34099999999999997 | 1 |
| 0.34099999999999997 | 1 |
| 0.34199999999999997 | 1 |
| 0.34199999999999997 | 1 |
| 0.34199999999999997 | 1 |
| 0.34199999999999997 | 1 |
| 0.34299999999999997 | 1 |
| 0.34299999999999997 | 1 |
| 0.34299999999999997 | 1 |
| 0.344 | 1 |
| 0.344 | 1 |
| 0.344 | 1 |
| 0.345 | 1 |
| 0.345 | 1 |
| 0.345 | 1 |
| 0.345 | 1 |
| 0.346 | 1 |
| 0.346 | 1 |
| 0.346 | 1 |
| 0.347 | 1 |
| 0.347 | 1 |
| 0.347 | 1 |
| 0.347 | 1 |
| 0.348 | 1 |
| 0.348 | 1 |
| 0.348 | 1 |
| 0.349 | 1 |
| 0.349 | 1 |
| 0.349 | 1 |
| 0.349 | 1 |
| 0.35 | 1 |
| 0.35 | 1 |
| 0.35 | 1 |
| 0.351 | 1 |
| 0.351 | 1 |
| 0.351 | 1 |
| 0.352 | 1 |
| 0.352 | 1 |
| 0.352 | 1 |
| 0.352 | 1 |
| 0.353 | 1 |
| 0.353 | 1 |
| 0.353 | 1 |
| 0.354 | 1 |
| 0.354 | 1 |
| 0.354 | 1 |
| 0.354 | 1 |
| 0.355 | 1 |
| 0.355 | 1 |
| 0.355 | 1 |
| 0.356 | 1 |
| 0.356 | 1 |
| 0.356 | 1 |
| 0.356 | 1 |
| 0.357 | 1 |
| 0.357 | 1 |
| 0.357 | 1 |
| 0.358 | 1 |
| 0.358 | 1 |
| 0.358 | 1 |
| 0.358 | 1 |
| 0.359 | 1 |
| 0.359 | 1 |
| 0.359 | 1 |
| 0.36 | 1 |
| 0.36 | 1 |
| 0.36 | 1 |
| 0.361 | 1 |
| 0.361 | 1 |
| 0.361 | 1 |
| 0.361 | 1 |
| 0.362 | 1 |
| 0.362 | 1 |
| 0.362 | 1 |
| 0.363 | 1 |
| 0.363 | 1 |
| 0.363 | 1 |
| 0.363 | 1 |
| 0.364 | 1 |
| 0.364 | 1 |
| 0.364 | 1 |
| 0.365 | 1 |
| 0.365 | 1 |
| 0.365 | 1 |
| 0.365 | 1 |
| 0.366 | 1 |
| 0.366 | 1 |
| 0.366 | 1 |
| 0.367 | 1 |
| 0.367 | 1 |
| 0.367 | 1 |
| 0.368 | 1 |
| 0.368 | 1 |
| 0.368 | 1 |
| 0.368 | 1 |
| 0.369 | 1 |
| 0.369 | 1 |
| 0.369 | 1 |
| 0.37 | 1 |
| 0.37 | 1 |
| 0.37 | 1 |
| 0.37 | 1 |
| 0.371 | 1 |
| 0.371 | 1 |
| 0.371 | 1 |
| 0.372 | 1 |
| 0.372 | 1 |
| 0.372 | 1 |
| 0.372 | 1 |
| 0.373 | 1 |
| 0.373 | 1 |
| 0.373 | 1 |
| 0.374 | 1 |
| 0.374 | 1 |
| 0.374 | 1 |
| 0.375 | 1 |
| 0.375 | 1 |
| 0.375 | 1 |
| 0.375 | 1 |
| 0.376 | 1 |
| 0.376 | 1 |
| 0.376 | 1 |
| 0.377 | 1 |
| 0.377 | 1 |
| 0.377 | 1 |
| 0.377 | 1 |
| 0.378 | 1 |
| 0.378 | 1 |
| 0.378 | 1 |
| 0.379 | 1 |
| 0.379 | 1 |
| 0.379 | 1 |
| 0.379 | 1 |
| 0.38 | 1 |
| 0.38 | 1 |
| 0.38 | 1 |
| 0.381 | 1 |
| 0.381 | 1 |
| 0.381 | 1 |
| 0.382 | 1 |
| 0.382 | 1 |
| 0.382 | 1 |
| 0.382 | 1 |
| 0.383 | 1 |
| 0.383 | 1 |
| 0.383 | 1 |
| 0.384 | 1 |
| 0.384 | 1 |
| 0.384 | 1 |
| 0.384 | 1 |
| 0.385 | 1 |
| 0.385 | 1 |
| 0.385 | 1 |
| 0.386 | 1 |
| 0.386 | 1 |
| 0.386 | 1 |
| 0.386 | 1 |
| 0.387 | 1 |
| 0.387 | 1 |
| 0.387 | 1 |
| 0.388 | 1 |
| 0.388 | 1 |
| 0.388 | 1 |
| 0.389 | 1 |
| 0.389 | 1 |
| 0.389 | 1 |
| 0.389 | 1 |
| 0.39 | 1 |
| 0.39 | 1 |
| 0.39 | 1 |
| 0.391 | 1 |
| 0.391 | 1 |
| 0.391 | 1 |
| 0.391 | 1 |
| 0.392 | 1 |
| 0.392 | 1 |
| 0.392 | 1 |
| 0.393 | 1 |
| 0.393 | 1 |
| 0.393 | 1 |
| 0.393 | 1 |
| 0.394 | 1 |
| 0.394 | 1 |
| 0.394 | 1 |
| 0.395 | 1 |
| 0.395 | 1 |
| 0.395 | 1 |
| 0.396 | 1 |
| 0.396 | 1 |
| 0.396 | 1 |
| 0.396 | 1 |
| 0.397 | 1 |
| 0.397 | 1 |
| 0.397 | 1 |
| 0.398 | 1 |
| 0.398 | 1 |
| 0.398 | 1 |
| 0.398 | 1 |
| 0.399 | 1 |
| 0.399 | 1 |
| 0.399 | 1 |
| 0.4 | 1 |
| 0.4 | 1 |
| 0.4 | 1 |
| 0.4 | 1 |
| 0.401 | 1 |
| 0.401 | 1 |
| 0.401 | 1 |
| 0.402 | 1 |
| 0.402 | 1 |
| 0.402 | 1 |
| 0.403 | 1 |
| 0.403 | 1 |
| 0.403 | 1 |
| 0.403 | 1 |
| 0.404 | 1 |
| 0.404 | 1 |
| 0.404 | 1 |
| 0.405 | 1 |
| 0.405 | 1 |
| 0.405 | 1 |
| 0.405 | 1 |
| 0.406 | 1 |
| 0.406 | 1 |
| 0.406 | 1 |
| 0.40700000000000003 | 1 |
| 0.40700000000000003 | 1 |
| 0.40700000000000003 | 1 |
| 0.40700000000000003 | 1 |
| 0.40800000000000003 | 1 |
| 0.40800000000000003 | 1 |
| 0.40800000000000003 | 1 |
| 0.40900000000000003 | 1 |
| 0.40900000000000003 | 1 |
| 0.40900000000000003 | 1 |
| 0.41000000000000003 | 1 |
| 0.41000000000000003 | 1 |
| 0.41000000000000003 | 1 |
| 0.41000000000000003 | 1 |
| 0.41100000000000003 | 1 |
| 0.41100000000000003 | 1 |
| 0.41100000000000003 | 1 |
| 0.41200000000000003 | 1 |
| 0.41200000000000003 | 1 |
| 0.41200000000000003 | 1 |
| 0.41200000000000003 | 1 |
| 0.41300000000000003 | 1 |
| 0.41300000000000003 | 1 |
| 0.41300000000000003 | 1 |
| 0.41400000000000003 | 1 |
| 0.41400000000000003 | 1 |
| 0.41400000000000003 | 1 |
| 0.41400000000000003 | 1 |
| 0.41500000000000004 | 1 |
| 0.41500000000000004 | 1 |
| 0.41500000000000004 | 1 |
| 0.41600000000000004 | 1 |
| 0.41600000000000004 | 1 |
| 0.41600000000000004 | 1 |
| 0.41600000000000004 | 1 |
| 0.41700000000000004 | 1 |
| 0.41700000000000004 | 1 |
| 0.41700000000000004 | 1 |
| 0.41800000000000004 | 1 |
| 0.41800000000000004 | 1 |
| 0.41800000000000004 | 1 |
| 0.41900000000000004 | 1 |
| 0.41900000000000004 | 1 |
| 0.41900000000000004 | 1 |
| 0.41900000000000004 | 1 |
| 0.42000000000000004 | 1 |
| 0.42000000000000004 | 1 |
| 0.42000000000000004 | 1 |
| 0.42100000000000004 | 1 |
| 0.42100000000000004 | 1 |
| 0.42100000000000004 | 1 |
| 0.42100000000000004 | 1 |
| 0.42200000000000004 | 1 |
| 0.42200000000000004 | 1 |
| 0.42200000000000004 | 1 |
| 0.42300000000000004 | 1 |
| 0.42300000000000004 | 1 |
| 0.42300000000000004 | 1 |
| 0.42300000000000004 | 1 |
| 0.42400000000000004 | 1 |
| 0.42400000000000004 | 1 |
| 0.42400000000000004 | 1 |
| 0.42500000000000004 | 1 |
| 0.42500000000000004 | 1 |
| 0.42500000000000004 | 1 |
| 0.42600000000000005 | 1 |
| 0.42600000000000005 | 1 |
| 0.42600000000000005 | 1 |
| 0.42600000000000005 | 1 |
| 0.42700000000000005 | 1 |
| 0.42700000000000005 | 1 |
| 0.42700000000000005 | 1 |
| 0.42800000000000005 | 1 |
| 0.42800000000000005 | 1 |
| 0.42800000000000005 | 1 |
| 0.42800000000000005 | 1 |
| 0.42900000000000005 | 1 |
| 0.42900000000000005 | 1 |
| 0.42900000000000005 | 1 |
| 0.43000000000000005 | 1 |
| 0.43000000000000005 | 1 |
| 0.43000000000000005 | 1 |
| 0.43000000000000005 | 1 |
| 0.43100000000000005 | 1 |
| 0.43100000000000005 | 1 |
| 0.43100000000000005 | 1 |
| 0.43200000000000005 | 1 |
| 0.43200000000000005 | 1 |
| 0.43200000000000005 | 1 |
| 0.43300000000000005 | 1 |
| 0.43300000000000005 | 1 |
| 0.43300000000000005 | 1 |
| 0.43300000000000005 | 1 |
| 0.43400000000000005 | 1 |
| 0.43400000000000005 | 1 |
| 0.43400000000000005 | 1 |
| 0.43500000000000005 | 1 |
| 0.43500000000000005 | 1 |
| 0.43500000000000005 | 1 |
| 0.43500000000000005 | 1 |
| 0.43600000000000005 | 1 |
| 0.43600000000000005 | 1 |
| 0.43600000000000005 | 1 |
| 0.43700000000000006 | 1 |
| 0.43700000000000006 | 1 |
| 0.43700000000000006 | 1 |
| 0.43700000000000006 | 1 |
| 0.43799999999999994 | 1 |
| 0.43799999999999994 | 1 |
| 0.43799999999999994 | 1 |
| 0.43899999999999995 | 1 |
| 0.43899999999999995 | 1 |
| 0.43899999999999995 | 1 |
| 0.43999999999999995 | 1 |
| 0.43999999999999995 | 1 |
| 0.43999999999999995 | 1 |
| 0.43999999999999995 | 1 |
| 0.44099999999999995 | 1 |
| 0.44099999999999995 | 1 |
| 0.44099999999999995 | 1 |
| 0.44199999999999995 | 1 |
| 0.44199999999999995 | 1 |
| 0.44199999999999995 | 1 |
| 0.44199999999999995 | 1 |
| 0.44299999999999995 | 1 |
| 0.44299999999999995 | 1 |
| 0.44299999999999995 | 1 |
| 0.44399999999999995 | 1 |
| 0.44399999999999995 | 1 |
| 0.44399999999999995 | 1 |
| 0.44399999999999995 | 1 |
| 0.44499999999999995 | 1 |
| 0.44499999999999995 | 1 |
| 0.44499999999999995 | 1 |
| 0.44599999999999995 | 1 |
| 0.44599999999999995 | 1 |
| 0.44599999999999995 | 1 |
| 0.44699999999999995 | 1 |
| 0.44699999999999995 | 1 |
| 0.44699999999999995 | 1 |
| 0.44699999999999995 | 1 |
| 0.44799999999999995 | 1 |
| 0.44799999999999995 | 1 |
| 0.44799999999999995 | 1 |
| 0.44899999999999995 | 1 |
| 0.44899999999999995 | 1 |
| 0.44899999999999995 | 1 |
| 0.44899999999999995 | 1 |
| 0.44999999999999996 | 1 |
| 0.44999999999999996 | 1 |
| 0.44999999999999996 | 1 |
| 0.45099999999999996 | 1 |
| 0.45099999999999996 | 1 |
| 0.45099999999999996 | 1 |
| 0.45099999999999996 | 1 |
| 0.45199999999999996 | 1 |
| 0.45199999999999996 | 1 |
| 0.45199999999999996 | 1 |
| 0.45299999999999996 | 1 |
| 0.45299999999999996 | 1 |
| 0.45299999999999996 | 1 |
| 0.45399999999999996 | 1 |
| 0.45399999999999996 | 1 |
| 0.45399999999999996 | 1 |
| 0.45399999999999996 | 1 |
| 0.45499999999999996 | 1 |
| 0.45499999999999996 | 1 |
| 0.45499999999999996 | 1 |
| 0.45599999999999996 | 1 |
| 0.45599999999999996 | 1 |
| 0.45599999999999996 | 1 |
| 0.45599999999999996 | 1 |
| 0.45699999999999996 | 1 |
| 0.45699999999999996 | 1 |
| 0.45699999999999996 | 1 |
| 0.45799999999999996 | 1 |
| 0.45799999999999996 | 1 |
| 0.45799999999999996 | 1 |
| 0.45799999999999996 | 1 |
| 0.45899999999999996 | 1 |
| 0.45899999999999996 | 1 |
| 0.45899999999999996 | 1 |
| 0.45999999999999996 | 1 |
| 0.45999999999999996 | 1 |
| 0.45999999999999996 | 1 |
| 0.46099999999999997 | 1 |
| 0.46099999999999997 | 1 |
| 0.46099999999999997 | 1 |
| 0.46099999999999997 | 1 |
| 0.46199999999999997 | 1 |
| 0.46199999999999997 | 1 |
| 0.46199999999999997 | 1 |
| 0.46299999999999997 | 1 |
| 0.46299999999999997 | 1 |
| 0.46299999999999997 | 1 |
| 0.46299999999999997 | 1 |
| 0.46399999999999997 | 1 |
| 0.46399999999999997 | 1 |
| 0.46399999999999997 | 1 |
| 0.46499999999999997 | 1 |
| 0.46499999999999997 | 1 |
| 0.46499999999999997 | 1 |
| 0.46499999999999997 | 1 |
| 0.46599999999999997 | 1 |
| 0.46599999999999997 | 1 |
| 0.46599999999999997 | 1 |
| 0.46699999999999997 | 1 |
| 0.46699999999999997 | 1 |
| 0.46699999999999997 | 1 |
| 0.46799999999999997 | 1 |
| 0.46799999999999997 | 1 |
| 0.46799999999999997 | 1 |
| 0.46799999999999997 | 1 |
| 0.469 | 1 |
| 0.469 | 1 |
| 0.469 | 1 |
| 0.47 | 1 |
| 0.47 | 1 |
| 0.47 | 1 |
| 0.47 | 1 |
| 0.471 | 1 |
| 0.471 | 1 |
| 0.471 | 1 |
| 0.472 | 1 |
| 0.472 | 1 |
| 0.472 | 1 |
| 0.472 | 1 |
| 0.473 | 1 |
| 0.473 | 1 |
| 0.473 | 1 |
| 0.474 | 1 |
| 0.474 | 1 |
| 0.474 | 1 |
| 0.474 | 1 |
| 0.475 | 1 |
| 0.475 | 1 |
| 0.475 | 1 |
| 0.476 | 1 |
| 0.476 | 1 |
| 0.476 | 1 |
| 0.477 | 1 |
| 0.477 | 1 |
| 0.477 | 1 |
| 0.477 | 1 |
| 0.478 | 1 |
| 0.478 | 1 |
| 0.478 | 1 |
| 0.479 | 1 |
| 0.479 | 1 |
| 0.479 | 1 |
| 0.479 | 1 |
| 0.48 | 1 |
| 0.48 | 1 |
| 0.48 | 1 |
| 0.481 | 1 |
| 0.481 | 1 |
| 0.481 | 1 |
| 0.481 | 1 |
| 0.482 | 1 |
| 0.482 | 1 |
| 0.482 | 1 |
| 0.483 | 1 |
| 0.483 | 1 |
| 0.483 | 1 |
| 0.484 | 1 |
| 0.484 | 1 |
| 0.484 | 1 |
| 0.484 | 1 |
| 0.485 | 1 |
| 0.485 | 1 |
| 0.485 | 1 |
| 0.486 | 1 |
| 0.486 | 1 |
| 0.486 | 1 |
| 0.486 | 1 |
| 0.487 | 1 |
| 0.487 | 1 |
| 0.487 | 1 |
| 0.488 | 1 |
| 0.488 | 1 |
| 0.488 | 1 |
| 0.488 | 1 |
| 0.489 | 1 |
| 0.489 | 1 |
| 0.489 | 1 |
| 0.49 | 1 |
| 0.49 | 1 |
| 0.49 | 1 |
| 0.491 | 1 |
| 0.491 | 1 |
| 0.491 | 1 |
| 0.491 | 1 |
| 0.492 | 1 |
| 0.492 | 1 |
| 0.492 | 1 |
| 0.493 | 1 |
| 0.493 | 1 |
| 0.493 | 1 |
| 0.493 | 1 |
| 0.494 | 1 |
| 0.494 | 1 |
| 0.494 | 1 |
| 0.495 | 1 |
| 0.495 | 1 |
| 0.495 | 1 |
| 0.495 | 1 |
| 0.496 | 1 |
| 0.496 | 1 |
| 0.496 | 1 |
| 0.497 | 1 |
| 0.497 | 1 |
| 0.497 | 1 |
| 0.498 | 1 |
| 0.498 | 1 |
| 0.498 | 1 |
| 0.498 | 1 |
| 0.499 | 1 |
| 0.499 | 1 |
| 0.499 | 1 |
| 0.5 | 1 |
| 0.5 | 1 |
| 0.5 | 1 |
| 0.5 | 1 |
| 0.501 | 1 |
| 0.501 | 1 |
| 0.501 | 1 |
| 0.502 | 1 |
| 0.502 | 1 |
| 0.502 | 1 |
| 0.502 | 1 |
| 0.503 | 1 |
| 0.503 | 1 |
| 0.503 | 1 |
| 0.504 | 1 |
| 0.504 | 1 |
| 0.504 | 1 |
| 0.505 | 1 |
| 0.505 | 1 |
| 0.505 | 1 |
| 0.505 | 1 |
| 0.506 | 1 |
| 0.506 | 1 |
| 0.506 | 1 |
| 0.507 | 1 |
| 0.507 | 1 |
| 0.507 | 1 |
| 0.507 | 1 |
| 0.508 | 1 |
| 0.508 | 1 |
| 0.508 | 1 |
| 0.509 | 1 |
| 0.509 | 1 |
| 0.509 | 1 |
| 0.509 | 1 |
| 0.51 | 1 |
| 0.51 | 1 |
| 0.51 | 1 |
| 0.511 | 1 |
| 0.511 | 1 |
| 0.511 | 1 |
| 0.512 | 1 |
| 0.512 | 1 |
| 0.512 | 1 |
| 0.512 | 1 |
| 0.513 | 1 |
| 0.513 | 1 |
| 0.513 | 1 |
| 0.514 | 1 |
| 0.514 | 1 |
| 0.514 | 1 |
| 0.514 | 1 |
| 0.515 | 1 |
| 0.515 | 1 |
| 0.515 | 1 |
| 0.516 | 1 |
| 0.516 | 1 |
| 0.516 | 1 |
| 0.516 | 1 |
| 0.517 | 1 |
| 0.517 | 1 |
| 0.517 | 1 |
| 0.518 | 1 |
| 0.518 | 1 |
| 0.518 | 1 |
| 0.519 | 1 |
| 0.519 | 1 |
| 0.519 | 1 |
| 0.519 | 1 |
| 0.52 | 1 |
| 0.52 | 1 |
| 0.52 | 1 |
| 0.521 | 1 |
| 0.521 | 1 |
| 0.521 | 1 |
| 0.521 | 1 |
| 0.522 | 1 |
| 0.522 | 1 |
| 0.522 | 1 |
| 0.523 | 1 |
| 0.523 | 1 |
| 0.523 | 1 |
| 0.523 | 1 |
| 0.524 | 1 |
| 0.524 | 1 |
| 0.524 | 1 |
| 0.525 | 1 |
| 0.525 | 1 |
| 0.525 | 1 |
| 0.526 | 1 |
| 0.526 | 1 |
| 0.526 | 1 |
| 0.526 | 1 |
| 0.527 | 1 |
| 0.527 | 1 |
| 0.527 | 1 |
| 0.528 | 1 |
| 0.528 | 1 |
| 0.528 | 1 |
| 0.528 | 1 |
| 0.529 | 1 |
| 0.529 | 1 |
| 0.529 | 1 |
| 0.53 | 1 |
| 0.53 | 1 |
| 0.53 | 1 |
| 0.53 | 1 |
| 0.531 | 1 |
| 0.531 | 1 |
| 0.531 | 1 |
| 0.532 | 1 |
| 0.532 | 1 |
| 0.532 | 1 |
| 0.532 | 1 |
| 0.5329999999999999 | 1 |
| 0.5329999999999999 | 1 |
| 0.5329999999999999 | 1 |
| 0.534 | 1 |
| 0.534 | 1 |
| 0.534 | 1 |
| 0.5349999999999999 | 1 |
| 0.5349999999999999 | 1 |
| 0.5349999999999999 | 1 |
| 0.5349999999999999 | 1 |
| 0.536 | 1 |
| 0.536 | 1 |
| 0.536 | 1 |
| 0.5369999999999999 | 1 |
| 0.5369999999999999 | 1 |
| 0.5369999999999999 | 1 |
| 0.5369999999999999 | 1 |
| 0.538 | 1 |
| 0.538 | 1 |
| 0.538 | 1 |
| 0.5389999999999999 | 1 |
| 0.5389999999999999 | 1 |
| 0.5389999999999999 | 1 |
| 0.5389999999999999 | 1 |
| 0.54 | 1 |
| 0.54 | 1 |
| 0.54 | 1 |
| 0.5409999999999999 | 1 |
| 0.5409999999999999 | 1 |
| 0.5409999999999999 | 1 |
| 0.542 | 1 |
| 0.542 | 1 |
| 0.542 | 1 |
| 0.542 | 1 |
| 0.5429999999999999 | 1 |
| 0.5429999999999999 | 1 |
| 0.5429999999999999 | 1 |
| 0.544 | 1 |
| 0.544 | 1 |
| 0.544 | 1 |
| 0.544 | 1 |
| 0.5449999999999999 | 1 |
| 0.5449999999999999 | 1 |
| 0.5449999999999999 | 1 |
| 0.546 | 1 |
| 0.546 | 1 |
| 0.546 | 1 |
| 0.546 | 1 |
| 0.5469999999999999 | 1 |
| 0.5469999999999999 | 1 |
| 0.5469999999999999 | 1 |
| 0.548 | 1 |
| 0.548 | 1 |
| 0.548 | 1 |
| 0.5489999999999999 | 1 |
| 0.5489999999999999 | 1 |
| 0.5489999999999999 | 1 |
| 0.5489999999999999 | 1 |
| 0.55 | 1 |
| 0.55 | 1 |
| 0.55 | 1 |
| 0.5509999999999999 | 1 |
| 0.5509999999999999 | 1 |
| 0.5509999999999999 | 1 |
| 0.5509999999999999 | 1 |
| 0.552 | 1 |
| 0.552 | 1 |
| 0.552 | 1 |
| 0.5529999999999999 | 1 |
| 0.5529999999999999 | 1 |
| 0.5529999999999999 | 1 |
| 0.5529999999999999 | 1 |
| 0.554 | 1 |
| 0.554 | 1 |
| 0.554 | 1 |
| 0.5549999999999999 | 1 |
| 0.5549999999999999 | 1 |
| 0.5549999999999999 | 1 |
| 0.556 | 1 |
| 0.556 | 1 |
| 0.556 | 1 |
| 0.556 | 1 |
| 0.5569999999999999 | 1 |
| 0.5569999999999999 | 1 |
| 0.5569999999999999 | 1 |
| 0.558 | 1 |
| 0.558 | 1 |
| 0.558 | 1 |
| 0.558 | 1 |
| 0.5589999999999999 | 1 |
| 0.5589999999999999 | 1 |
| 0.5589999999999999 | 1 |
| 0.56 | 1 |
| 0.56 | 1 |
| 0.56 | 1 |
| 0.56 | 1 |
| 0.5609999999999999 | 1 |
| 0.5609999999999999 | 1 |
| 0.5609999999999999 | 1 |
| 0.562 | 1 |
| 0.562 | 1 |
| 0.562 | 1 |
| 0.563 | 1 |
| 0.563 | 1 |
| 0.563 | 1 |
| 0.563 | 1 |
| 0.5640000000000001 | 1 |
| 0.5640000000000001 | 1 |
| 0.5640000000000001 | 1 |
| 0.565 | 1 |
| 0.565 | 1 |
| 0.565 | 1 |
| 0.565 | 1 |
| 0.5660000000000001 | 1 |
| 0.5660000000000001 | 1 |
| 0.5660000000000001 | 1 |
| 0.567 | 1 |
| 0.567 | 1 |
| 0.567 | 1 |
| 0.567 | 1 |
| 0.5680000000000001 | 1 |
| 0.5680000000000001 | 1 |
| 0.5680000000000001 | 1 |
| 0.569 | 1 |
| 0.569 | 1 |
| 0.569 | 1 |
| 0.5700000000000001 | 1 |
| 0.5700000000000001 | 1 |
| 0.5700000000000001 | 1 |
| 0.5700000000000001 | 1 |
| 0.571 | 1 |
| 0.571 | 1 |
| 0.571 | 1 |
| 0.5720000000000001 | 1 |
| 0.5720000000000001 | 1 |
| 0.5720000000000001 | 1 |
| 0.5720000000000001 | 1 |
| 0.573 | 1 |
| 0.573 | 1 |
| 0.573 | 1 |
| 0.5740000000000001 | 1 |
| 0.5740000000000001 | 1 |
| 0.5740000000000001 | 1 |
| 0.5740000000000001 | 1 |
| 0.575 | 1 |
| 0.575 | 1 |
| 0.575 | 1 |
| 0.5760000000000001 | 1 |
| 0.5760000000000001 | 1 |
| 0.5760000000000001 | 1 |
| 0.577 | 1 |
| 0.577 | 1 |
| 0.577 | 1 |
| 0.577 | 1 |
| 0.5780000000000001 | 1 |
| 0.5780000000000001 | 1 |
| 0.5780000000000001 | 1 |
| 0.579 | 1 |
| 0.579 | 1 |
| 0.579 | 1 |
| 0.579 | 1 |
| 0.5800000000000001 | 1 |
| 0.5800000000000001 | 1 |
| 0.5800000000000001 | 1 |
| 0.581 | 1 |
| 0.581 | 1 |
| 0.581 | 1 |
| 0.581 | 1 |
| 0.5820000000000001 | 1 |
| 0.5820000000000001 | 1 |
| 0.5820000000000001 | 1 |
| 0.583 | 1 |
| 0.583 | 1 |
| 0.583 | 1 |
| 0.5840000000000001 | 1 |
| 0.5840000000000001 | 1 |
| 0.5840000000000001 | 1 |
| 0.5840000000000001 | 1 |
| 0.585 | 1 |
| 0.585 | 1 |
| 0.585 | 1 |
| 0.5860000000000001 | 1 |
| 0.5860000000000001 | 1 |
| 0.5860000000000001 | 1 |
| 0.5860000000000001 | 1 |
| 0.587 | 1 |
| 0.587 | 1 |
| 0.587 | 1 |
| 0.5880000000000001 | 1 |
| 0.5880000000000001 | 1 |
| 0.5880000000000001 | 1 |
| 0.5880000000000001 | 1 |
| 0.589 | 1 |
| 0.589 | 1 |
| 0.589 | 1 |
| 0.5900000000000001 | 1 |
| 0.5900000000000001 | 1 |
| 0.5900000000000001 | 1 |
| 0.5900000000000001 | 1 |
| 0.591 | 1 |
| 0.591 | 1 |
| 0.591 | 1 |
| 0.5920000000000001 | 1 |
| 0.5920000000000001 | 1 |
| 0.5920000000000001 | 1 |
| 0.593 | 1 |
| 0.593 | 1 |
| 0.593 | 1 |
| 0.593 | 1 |
| 0.594 | 1 |
| 0.594 | 1 |
| 0.594 | 1 |
| 0.595 | 1 |
| 0.595 | 1 |
| 0.595 | 1 |
| 0.595 | 1 |
| 0.596 | 1 |
| 0.596 | 1 |
| 0.596 | 1 |
| 0.597 | 1 |
| 0.597 | 1 |
| 0.597 | 1 |
| 0.597 | 1 |
| 0.598 | 1 |
| 0.598 | 1 |
| 0.598 | 1 |
| 0.599 | 1 |
| 0.599 | 1 |
| 0.599 | 1 |
| 0.6 | 1 |
| 0.6 | 1 |
| 0.6 | 1 |
| 0.6 | 1 |
| 0.601 | 1 |
| 0.601 | 1 |
| 0.601 | 1 |
| 0.602 | 1 |
| 0.602 | 1 |
| 0.602 | 1 |
| 0.602 | 1 |
| 0.603 | 1 |
| 0.603 | 1 |
| 0.603 | 1 |
| 0.604 | 1 |
| 0.604 | 1 |
| 0.604 | 1 |
| 0.604 | 1 |
| 0.605 | 1 |
| 0.605 | 1 |
| 0.605 | 1 |
| 0.606 | 1 |
| 0.606 | 1 |
| 0.606 | 1 |
| 0.607 | 1 |
| 0.607 | 1 |
| 0.607 | 1 |
| 0.607 | 1 |
| 0.608 | 1 |
| 0.608 | 1 |
| 0.608 | 1 |
| 0.609 | 1 |
| 0.609 | 1 |
| 0.609 | 1 |
| 0.609 | 1 |
| 0.61 | 1 |
| 0.61 | 1 |
| 0.61 | 1 |
| 0.611 | 1 |
| 0.611 | 1 |
| 0.611 | 1 |
| 0.611 | 1 |
| 0.612 | 1 |
| 0.612 | 1 |
| 0.612 | 1 |
| 0.613 | 1 |
| 0.613 | 1 |
| 0.613 | 1 |
| 0.614 | 1 |
| 0.614 | 1 |
| 0.614 | 1 |
| 0.614 | 1 |
| 0.615 | 1 |
| 0.615 | 1 |
| 0.615 | 1 |
| 0.616 | 1 |
| 0.616 | 1 |
| 0.616 | 1 |
| 0.616 | 1 |
| 0.617 | 1 |
| 0.617 | 1 |
| 0.617 | 1 |
| 0.618 | 1 |
| 0.618 | 1 |
| 0.618 | 1 |
| 0.618 | 1 |
| 0.619 | 1 |
| 0.619 | 1 |
| 0.619 | 1 |
| 0.62 | 1 |
| 0.62 | 1 |
| 0.62 | 1 |
| 0.621 | 1 |
| 0.621 | 1 |
| 0.621 | 1 |
| 0.621 | 1 |
| 0.622 | 1 |
| 0.622 | 1 |
| 0.622 | 1 |
| 0.623 | 1 |
| 0.623 | 1 |
| 0.623 | 1 |
| 0.623 | 1 |
| 0.624 | 1 |
| 0.624 | 1 |
| 0.624 | 1 |
| 0.625 | 1 |
| 0.625 | 1 |
| 0.625 | 1 |
| 0.625 | 1 |
| 0.626 | 1 |
| 0.626 | 1 |
| 0.626 | 1 |
| 0.627 | 1 |
| 0.627 | 1 |
| 0.627 | 1 |
| 0.628 | 1 |
| 0.628 | 1 |
| 0.628 | 1 |
| 0.628 | 1 |
| 0.629 | 1 |
| 0.629 | 1 |
| 0.629 | 1 |
| 0.63 | 1 |
| 0.63 | 1 |
| 0.63 | 1 |
| 0.63 | 1 |
| 0.631 | 1 |
| 0.631 | 1 |
| 0.631 | 1 |
| 0.632 | 1 |
| 0.632 | 1 |
| 0.632 | 1 |
| 0.632 | 1 |
| 0.633 | 1 |
| 0.633 | 1 |
| 0.633 | 1 |
| 0.634 | 1 |
| 0.634 | 1 |
| 0.634 | 1 |
| 0.635 | 1 |
| 0.635 | 1 |
| 0.635 | 1 |
| 0.635 | 1 |
| 0.636 | 1 |
| 0.636 | 1 |
| 0.636 | 1 |
| 0.637 | 1 |
| 0.637 | 1 |
| 0.637 | 1 |
| 0.637 | 1 |
| 0.638 | 1 |
| 0.638 | 1 |
| 0.638 | 1 |
| 0.639 | 1 |
| 0.639 | 1 |
| 0.639 | 1 |
| 0.639 | 1 |
| 0.64 | 1 |
| 0.64 | 1 |
| 0.64 | 1 |
| 0.641 | 1 |
| 0.641 | 1 |
| 0.641 | 1 |
| 0.642 | 1 |
| 0.642 | 1 |
| 0.642 | 1 |
| 0.642 | 1 |
| 0.643 | 1 |
| 0.643 | 1 |
| 0.643 | 1 |
| 0.644 | 1 |
| 0.644 | 1 |
| 0.644 | 1 |
| 0.644 | 1 |
| 0.645 | 1 |
| 0.645 | 1 |
| 0.645 | 1 |
| 0.646 | 1 |
| 0.646 | 1 |
| 0.646 | 1 |
| 0.646 | 1 |
| 0.647 | 1 |
| 0.647 | 1 |
| 0.647 | 1 |
| 0.648 | 1 |
| 0.648 | 1 |
| 0.648 | 1 |
| 0.648 | 1 |
| 0.649 | 1 |
| 0.649 | 1 |
| 0.649 | 1 |
| 0.65 | 1 |
| 0.65 | 1 |
| 0.65 | 1 |
| 0.651 | 1 |
| 0.651 | 1 |
| 0.651 | 1 |
| 0.651 | 1 |
| 0.652 | 1 |
| 0.652 | 1 |
| 0.652 | 1 |
| 0.653 | 1 |
| 0.653 | 1 |
| 0.653 | 1 |
| 0.653 | 1 |
| 0.654 | 1 |
| 0.654 | 1 |
| 0.654 | 1 |
| 0.655 | 1 |
| 0.655 | 1 |
| 0.655 | 1 |
| 0.655 | 1 |
| 0.656 | 1 |
| 0.656 | 1 |
| 0.656 | 1 |
| 0.657 | 1 |
| 0.657 | 1 |
| 0.657 | 1 |
| 0.6579999999999999 | 1 |
| 0.6579999999999999 | 1 |
| 0.6579999999999999 | 1 |
| 0.6579999999999999 | 1 |
| 0.659 | 1 |
| 0.659 | 1 |
| 0.659 | 1 |
| 0.6599999999999999 | 1 |
| 0.6599999999999999 | 1 |
| 0.6599999999999999 | 1 |
| 0.6599999999999999 | 1 |
| 0.661 | 1 |
| 0.661 | 1 |
| 0.661 | 1 |
| 0.6619999999999999 | 1 |
| 0.6619999999999999 | 1 |
| 0.6619999999999999 | 1 |
| 0.6619999999999999 | 1 |
| 0.663 | 1 |
| 0.663 | 1 |
| 0.663 | 1 |
| 0.6639999999999999 | 1 |
| 0.6639999999999999 | 1 |
| 0.6639999999999999 | 1 |
| 0.665 | 1 |
| 0.665 | 1 |
| 0.665 | 1 |
| 0.665 | 1 |
| 0.6659999999999999 | 1 |
| 0.6659999999999999 | 1 |
| 0.6659999999999999 | 1 |
| 0.667 | 1 |
| 0.667 | 1 |
| 0.667 | 1 |
| 0.667 | 1 |
| 0.6679999999999999 | 1 |
| 0.6679999999999999 | 1 |
| 0.6679999999999999 | 1 |
| 0.669 | 1 |
| 0.669 | 1 |
| 0.669 | 1 |
| 0.669 | 1 |
| 0.6699999999999999 | 1 |
| 0.6699999999999999 | 1 |
| 0.6699999999999999 | 1 |
| 0.671 | 1 |
| 0.671 | 1 |
| 0.671 | 1 |
| 0.6719999999999999 | 1 |
| 0.6719999999999999 | 1 |
| 0.6719999999999999 | 1 |
| 0.6719999999999999 | 1 |
| 0.673 | 1 |
| 0.673 | 1 |
| 0.673 | 1 |
| 0.6739999999999999 | 1 |
| 0.6739999999999999 | 1 |
| 0.6739999999999999 | 1 |
| 0.6739999999999999 | 1 |
| 0.675 | 1 |
| 0.675 | 1 |
| 0.675 | 1 |
| 0.6759999999999999 | 1 |
| 0.6759999999999999 | 1 |
| 0.6759999999999999 | 1 |
| 0.6759999999999999 | 1 |
| 0.677 | 1 |
| 0.677 | 1 |
| 0.677 | 1 |
| 0.6779999999999999 | 1 |
| 0.6779999999999999 | 1 |
| 0.6779999999999999 | 1 |
| 0.679 | 1 |
| 0.679 | 1 |
| 0.679 | 1 |
| 0.679 | 1 |
| 0.6799999999999999 | 1 |
| 0.6799999999999999 | 1 |
| 0.6799999999999999 | 1 |
| 0.681 | 1 |
| 0.681 | 1 |
| 0.681 | 1 |
| 0.681 | 1 |
| 0.6819999999999999 | 1 |
| 0.6819999999999999 | 1 |
| 0.6819999999999999 | 1 |
| 0.683 | 1 |
| 0.683 | 1 |
| 0.683 | 1 |
| 0.683 | 1 |
| 0.6839999999999999 | 1 |
| 0.6839999999999999 | 1 |
| 0.6839999999999999 | 1 |
| 0.685 | 1 |
| 0.685 | 1 |
| 0.685 | 1 |
| 0.6859999999999999 | 1 |
| 0.6859999999999999 | 1 |
| 0.6859999999999999 | 1 |
| 0.6859999999999999 | 1 |
| 0.687 | 1 |
| 0.687 | 1 |
| 0.687 | 1 |
| 0.688 | 1 |
| 0.688 | 1 |
| 0.688 | 1 |
| 0.688 | 1 |
| 0.6890000000000001 | 1 |
| 0.6890000000000001 | 1 |
| 0.6890000000000001 | 1 |
| 0.69 | 1 |
| 0.69 | 1 |
| 0.69 | 1 |
| 0.69 | 1 |
| 0.6910000000000001 | 1 |
| 0.6910000000000001 | 1 |
| 0.6910000000000001 | 1 |
| 0.692 | 1 |
| 0.692 | 1 |
| 0.692 | 1 |
| 0.6930000000000001 | 1 |
| 0.6930000000000001 | 1 |
| 0.6930000000000001 | 1 |
| 0.6930000000000001 | 1 |
| 0.694 | 1 |
| 0.694 | 1 |
| 0.694 | 1 |
| 0.6950000000000001 | 1 |
| 0.6950000000000001 | 1 |
| 0.6950000000000001 | 1 |
| 0.6950000000000001 | 1 |
| 0.696 | 1 |
| 0.696 | 1 |
| 0.696 | 1 |
| 0.6970000000000001 | 1 |
| 0.6970000000000001 | 1 |
| 0.6970000000000001 | 1 |
| 0.6970000000000001 | 1 |
| 0.698 | 1 |
| 0.698 | 1 |
| 0.698 | 1 |
| 0.6990000000000001 | 1 |
| 0.6990000000000001 | 1 |
| 0.6990000000000001 | 1 |
| 0.7 | 1 |
| 0.7 | 1 |
| 0.7 | 1 |
| 0.7 | 1 |
| 0.7010000000000001 | 1 |
| 0.7010000000000001 | 1 |
| 0.7010000000000001 | 1 |
| 0.702 | 1 |
| 0.702 | 1 |
| 0.702 | 1 |
| 0.702 | 1 |
| 0.7030000000000001 | 1 |
| 0.7030000000000001 | 1 |
| 0.7030000000000001 | 1 |
| 0.704 | 1 |
| 0.704 | 1 |
| 0.704 | 1 |
| 0.704 | 1 |
| 0.7050000000000001 | 1 |
| 0.7050000000000001 | 1 |
| 0.7050000000000001 | 1 |
| 0.706 | 1 |
| 0.706 | 1 |
| 0.706 | 1 |
| 0.706 | 1 |
| 0.7070000000000001 | 1 |
| 0.7070000000000001 | 1 |
| 0.7070000000000001 | 1 |
| 0.708 | 1 |
| 0.708 | 1 |
| 0.708 | 1 |
| 0.7090000000000001 | 1 |
| 0.7090000000000001 | 1 |
| 0.7090000000000001 | 1 |
| 0.7090000000000001 | 1 |
| 0.71 | 1 |
| 0.71 | 1 |
| 0.71 | 1 |
| 0.7110000000000001 | 1 |
| 0.7110000000000001 | 1 |
| 0.7110000000000001 | 1 |
| 0.7110000000000001 | 1 |
| 0.712 | 1 |
| 0.712 | 1 |
| 0.712 | 1 |
| 0.7130000000000001 | 1 |
| 0.7130000000000001 | 1 |
| 0.7130000000000001 | 1 |
| 0.7130000000000001 | 1 |
| 0.714 | 1 |
| 0.714 | 1 |
| 0.714 | 1 |
| 0.7150000000000001 | 1 |
| 0.7150000000000001 | 1 |
| 0.7150000000000001 | 1 |
| 0.716 | 1 |
| 0.716 | 1 |
| 0.716 | 1 |
| 0.716 | 1 |
| 0.7170000000000001 | 1 |
| 0.7170000000000001 | 1 |
| 0.7170000000000001 | 1 |
| 0.718 | 1 |
| 0.718 | 1 |
| 0.718 | 1 |
| 0.718 | 1 |
| 0.719 | 1 |
| 0.719 | 1 |
| 0.719 | 1 |
| 0.72 | 1 |
| 0.72 | 1 |
| 0.72 | 1 |
| 0.72 | 1 |
| 0.721 | 1 |
| 0.721 | 1 |
| 0.721 | 1 |
| 0.722 | 1 |
| 0.722 | 1 |
| 0.722 | 1 |
| 0.723 | 1 |
| 0.723 | 1 |
| 0.723 | 1 |
| 0.723 | 1 |
| 0.724 | 1 |
| 0.724 | 1 |
| 0.724 | 1 |
| 0.725 | 1 |
| 0.725 | 1 |
| 0.725 | 1 |
| 0.725 | 1 |
| 0.726 | 1 |
| 0.726 | 1 |
| 0.726 | 1 |
| 0.727 | 1 |
| 0.727 | 1 |
| 0.727 | 1 |
| 0.727 | 1 |
| 0.728 | 1 |
| 0.728 | 1 |
| 0.728 | 1 |
| 0.729 | 1 |
| 0.729 | 1 |
| 0.729 | 1 |
| 0.73 | 1 |
| 0.73 | 1 |
| 0.73 | 1 |
| 0.73 | 1 |
| 0.731 | 1 |
| 0.731 | 1 |
| 0.731 | 1 |
| 0.732 | 1 |
| 0.732 | 1 |
| 0.732 | 1 |
| 0.732 | 1 |
| 0.733 | 1 |
| 0.733 | 1 |
| 0.733 | 1 |
| 0.734 | 1 |
| 0.734 | 1 |
| 0.734 | 1 |
| 0.734 | 1 |
| 0.735 | 1 |
| 0.735 | 1 |
| 0.735 | 1 |
| 0.736 | 1 |
| 0.736 | 1 |
| 0.736 | 1 |
| 0.737 | 1 |
| 0.737 | 1 |
| 0.737 | 1 |
| 0.737 | 1 |
| 0.738 | 1 |
| 0.738 | 1 |
| 0.738 | 1 |
| 0.739 | 1 |
| 0.739 | 1 |
| 0.739 | 1 |
| 0.739 | 1 |
| 0.74 | 1 |
| 0.74 | 1 |
| 0.74 | 1 |
| 0.741 | 1 |
| 0.741 | 1 |
| 0.741 | 1 |
| 0.741 | 1 |
| 0.742 | 1 |
| 0.742 | 1 |
| 0.742 | 1 |
| 0.743 | 1 |
| 0.743 | 1 |
| 0.743 | 1 |
| 0.744 | 1 |
| 0.744 | 1 |
| 0.744 | 1 |
| 0.744 | 1 |
| 0.745 | 1 |
| 0.745 | 1 |
| 0.745 | 1 |
| 0.746 | 1 |
| 0.746 | 1 |
| 0.746 | 1 |
| 0.746 | 1 |
| 0.747 | 1 |
| 0.747 | 1 |
| 0.747 | 1 |
| 0.748 | 1 |
| 0.748 | 1 |
| 0.748 | 1 |
| 0.748 | 1 |
| 0.749 | 1 |
| 0.749 | 1 |
| 0.749 | 1 |
| 0.75 | 1 |
| 0.75 | 1 |
| 0.75 | 1 |
| 0.751 | 1 |
| 0.751 | 1 |
| 0.751 | 1 |
| 0.751 | 1 |
| 0.752 | 1 |
| 0.752 | 1 |
| 0.752 | 1 |
| 0.753 | 1 |
| 0.753 | 1 |
| 0.753 | 1 |
| 0.753 | 1 |
| 0.754 | 1 |
| 0.754 | 1 |
| 0.754 | 1 |
| 0.755 | 1 |
| 0.755 | 1 |
| 0.755 | 1 |
| 0.755 | 1 |
| 0.756 | 1 |
| 0.756 | 1 |
| 0.756 | 1 |
| 0.757 | 1 |
| 0.757 | 1 |
| 0.757 | 1 |
| 0.758 | 1 |
| 0.758 | 1 |
| 0.758 | 1 |
| 0.758 | 1 |
| 0.759 | 1 |
| 0.759 | 1 |
| 0.759 | 1 |
| 0.76 | 1 |
| 0.76 | 1 |
| 0.76 | 1 |
| 0.76 | 1 |
| 0.761 | 1 |
| 0.761 | 1 |
| 0.761 | 1 |
| 0.762 | 1 |
| 0.762 | 1 |
| 0.762 | 1 |
| 0.762 | 1 |
| 0.763 | 1 |
| 0.763 | 1 |
| 0.763 | 1 |
| 0.764 | 1 |
| 0.764 | 1 |
| 0.764 | 1 |
| 0.765 | 1 |
| 0.765 | 1 |
| 0.765 | 1 |
| 0.765 | 1 |
| 0.766 | 1 |
| 0.766 | 1 |
| 0.766 | 1 |
| 0.767 | 1 |
| 0.767 | 1 |
| 0.767 | 1 |
| 0.767 | 1 |
| 0.768 | 1 |
| 0.768 | 1 |
| 0.768 | 1 |
| 0.769 | 1 |
| 0.769 | 1 |
| 0.769 | 1 |
| 0.769 | 1 |
| 0.77 | 1 |
| 0.77 | 1 |
| 0.77 | 1 |
| 0.771 | 1 |
| 0.771 | 1 |
| 0.771 | 1 |
| 0.771 | 1 |
| 0.772 | 1 |
| 0.772 | 1 |
| 0.772 | 1 |
| 0.773 | 1 |
| 0.773 | 1 |
| 0.773 | 1 |
| 0.774 | 1 |
| 0.774 | 1 |
| 0.774 | 1 |
| 0.774 | 1 |
| 0.775 | 1 |
| 0.775 | 1 |
| 0.775 | 1 |
| 0.776 | 1 |
| 0.776 | 1 |
| 0.776 | 1 |
| 0.776 | 1 |
| 0.777 | 1 |
| 0.777 | 1 |
| 0.777 | 1 |
| 0.778 | 1 |
| 0.778 | 1 |
| 0.778 | 1 |
| 0.778 | 1 |
| 0.779 | 1 |
| 0.779 | 1 |
| 0.779 | 1 |
| 0.78 | 1 |
| 0.78 | 1 |
| 0.78 | 1 |
| 0.781 | 1 |
| 0.781 | 1 |
| 0.781 | 1 |
| 0.781 | 1 |
| 0.782 | 1 |
| 0.782 | 1 |
| 0.782 | 1 |
| 0.783 | 1 |
| 0.783 | 1 |
| 0.783 | 1 |
| 0.783 | 1 |
| 0.784 | 1 |
| 0.784 | 1 |
| 0.784 | 1 |
| 0.785 | 1 |
| 0.785 | 1 |
| 0.785 | 1 |
| 0.785 | 1 |
| 0.786 | 1 |
| 0.786 | 1 |
| 0.786 | 1 |
| 0.787 | 1 |
| 0.787 | 1 |
| 0.787 | 1 |
| 0.788 | 1 |
| 0.788 | 1 |
| 0.788 | 1 |
| 0.788 | 1 |
| 0.789 | 1 |
| 0.789 | 1 |
| 0.789 | 1 |
| 0.79 | 1 |
| 0.79 | 1 |
| 0.79 | 1 |
| 0.79 | 1 |
| 0.791 | 1 |
| 0.791 | 1 |
| 0.791 | 1 |
| 0.792 | 1 |
| 0.792 | 1 |
| 0.792 | 1 |
| 0.792 | 1 |
| 0.793 | 1 |
| 0.793 | 1 |
| 0.793 | 1 |
| 0.794 | 1 |
| 0.794 | 1 |
| 0.794 | 1 |
| 0.795 | 1 |
| 0.795 | 1 |
| 0.795 | 1 |
| 0.795 | 1 |
| 0.796 | 1 |
| 0.796 | 1 |
| 0.796 | 1 |
| 0.7969999999999999 | 1 |
| 0.7969999999999999 | 1 |
| 0.7969999999999999 | 1 |
| 0.7969999999999999 | 1 |
| 0.798 | 1 |
| 0.798 | 1 |
| 0.798 | 1 |
| 0.7989999999999999 | 1 |
| 0.7989999999999999 | 1 |
| 0.7989999999999999 | 1 |
| 0.7989999999999999 | 1 |
| 0.8 | 1 |
| 0.8 | 1 |
| 0.8 | 1 |
| 0.8009999999999999 | 1 |
| 0.8009999999999999 | 1 |
| 0.8009999999999999 | 1 |
| 0.802 | 1 |
| 0.802 | 1 |
| 0.802 | 1 |
| 0.802 | 1 |
| 0.8029999999999999 | 1 |
| 0.8029999999999999 | 1 |
| 0.8029999999999999 | 1 |
| 0.804 | 1 |
| 0.804 | 1 |
| 0.804 | 1 |
| 0.804 | 1 |
| 0.8049999999999999 | 1 |
| 0.8049999999999999 | 1 |
| 0.8049999999999999 | 1 |
| 0.806 | 1 |
| 0.806 | 1 |
| 0.806 | 1 |
| 0.806 | 1 |
| 0.8069999999999999 | 1 |
| 0.8069999999999999 | 1 |
| 0.8069999999999999 | 1 |
| 0.808 | 1 |
| 0.808 | 1 |
| 0.808 | 1 |
| 0.8089999999999999 | 1 |
| 0.8089999999999999 | 1 |
| 0.8089999999999999 | 1 |
| 0.8089999999999999 | 1 |
| 0.81 | 1 |
| 0.81 | 1 |
| 0.81 | 1 |
| 0.8109999999999999 | 1 |
| 0.8109999999999999 | 1 |
| 0.8109999999999999 | 1 |
| 0.8109999999999999 | 1 |
| 0.812 | 1 |
| 0.812 | 1 |
| 0.812 | 1 |
| 0.813 | 1 |
| 0.813 | 1 |
| 0.813 | 1 |
| 0.813 | 1 |
| 0.8140000000000001 | 1 |
| 0.8140000000000001 | 1 |
| 0.8140000000000001 | 1 |
| 0.815 | 1 |
| 0.815 | 1 |
| 0.815 | 1 |
| 0.8160000000000001 | 1 |
| 0.8160000000000001 | 1 |
| 0.8160000000000001 | 1 |
| 0.8160000000000001 | 1 |
| 0.817 | 1 |
| 0.817 | 1 |
| 0.817 | 1 |
| 0.8180000000000001 | 1 |
| 0.8180000000000001 | 1 |
| 0.8180000000000001 | 1 |
| 0.8180000000000001 | 1 |
| 0.819 | 1 |
| 0.819 | 1 |
| 0.819 | 1 |
| 0.8200000000000001 | 1 |
| 0.8200000000000001 | 1 |
| 0.8200000000000001 | 1 |
| 0.8200000000000001 | 1 |
| 0.821 | 1 |
| 0.821 | 1 |
| 0.821 | 1 |
| 0.8220000000000001 | 1 |
| 0.8220000000000001 | 1 |
| 0.8220000000000001 | 1 |
| 0.823 | 1 |
| 0.823 | 1 |
| 0.823 | 1 |
| 0.823 | 1 |
| 0.8240000000000001 | 1 |
| 0.8240000000000001 | 1 |
| 0.8240000000000001 | 1 |
| 0.825 | 1 |
| 0.825 | 1 |
| 0.825 | 1 |
| 0.825 | 1 |
| 0.8260000000000001 | 1 |
| 0.8260000000000001 | 1 |
| 0.8260000000000001 | 1 |
| 0.827 | 1 |
| 0.827 | 1 |
| 0.827 | 1 |
| 0.827 | 1 |
| 0.8280000000000001 | 1 |
| 0.8280000000000001 | 1 |
| 0.8280000000000001 | 1 |
| 0.829 | 1 |
| 0.829 | 1 |
| 0.829 | 1 |
| 0.829 | 1 |
| 0.83 | 1 |
| 0.83 | 1 |
| 0.83 | 1 |
| 0.831 | 1 |
| 0.831 | 1 |
| 0.831 | 1 |
| 0.832 | 1 |
| 0.832 | 1 |
| 0.832 | 1 |
| 0.832 | 1 |
| 0.833 | 1 |
| 0.833 | 1 |
| 0.833 | 1 |
| 0.834 | 1 |
| 0.834 | 1 |
| 0.834 | 1 |
| 0.834 | 1 |
| 0.835 | 1 |
| 0.835 | 1 |
| 0.835 | 1 |
| 0.836 | 1 |
| 0.836 | 1 |
| 0.836 | 1 |
| 0.836 | 1 |
| 0.837 | 1 |
| 0.837 | 1 |
| 0.837 | 1 |
| 0.838 | 1 |
| 0.838 | 1 |
| 0.838 | 1 |
| 0.839 | 1 |
| 0.839 | 1 |
| 0.839 | 1 |
| 0.839 | 1 |
| 0.84 | 1 |
| 0.84 | 1 |
| 0.84 | 1 |
| 0.841 | 1 |
| 0.841 | 1 |
| 0.841 | 1 |
| 0.841 | 1 |
| 0.842 | 1 |
| 0.842 | 1 |
| 0.842 | 1 |
| 0.843 | 1 |
| 0.843 | 1 |
| 0.843 | 1 |
| 0.843 | 1 |
| 0.844 | 1 |
| 0.844 | 1 |
| 0.844 | 1 |
| 0.845 | 1 |
| 0.845 | 1 |
| 0.845 | 1 |
| 0.846 | 1 |
| 0.846 | 1 |
| 0.846 | 1 |
| 0.846 | 1 |
| 0.847 | 1 |
| 0.847 | 1 |
| 0.847 | 1 |
| 0.848 | 1 |
| 0.848 | 1 |
| 0.848 | 1 |
| 0.848 | 1 |
| 0.849 | 1 |
| 0.849 | 1 |
| 0.849 | 1 |
| 0.85 | 1 |
| 0.85 | 1 |
| 0.85 | 1 |
| 0.85 | 1 |
| 0.851 | 1 |
| 0.851 | 1 |
| 0.851 | 1 |
| 0.852 | 1 |
| 0.852 | 1 |
| 0.852 | 1 |
| 0.853 | 1 |
| 0.853 | 1 |
| 0.853 | 1 |
| 0.853 | 1 |
| 0.854 | 1 |
| 0.854 | 1 |
| 0.854 | 1 |
| 0.855 | 1 |
| 0.855 | 1 |
| 0.855 | 1 |
| 0.855 | 1 |
| 0.856 | 1 |
| 0.856 | 1 |
| 0.856 | 1 |
| 0.857 | 1 |
| 0.857 | 1 |
| 0.857 | 1 |
| 0.857 | 1 |
| 0.858 | 1 |
| 0.858 | 1 |
| 0.858 | 1 |
| 0.859 | 1 |
| 0.859 | 1 |
| 0.859 | 1 |
| 0.86 | 1 |
| 0.86 | 1 |
| 0.86 | 1 |
| 0.86 | 1 |
| 0.861 | 1 |
| 0.861 | 1 |
| 0.861 | 1 |
| 0.862 | 1 |
| 0.862 | 1 |
| 0.862 | 1 |
| 0.862 | 1 |
| 0.863 | 1 |
| 0.863 | 1 |
| 0.863 | 1 |
| 0.864 | 1 |
| 0.864 | 1 |
| 0.864 | 1 |
| 0.864 | 1 |
| 0.865 | 1 |
| 0.865 | 1 |
| 0.865 | 1 |
| 0.866 | 1 |
| 0.866 | 1 |
| 0.866 | 1 |
| 0.867 | 1 |
| 0.867 | 1 |
| 0.867 | 1 |
| 0.867 | 1 |
| 0.868 | 1 |
| 0.868 | 1 |
| 0.868 | 1 |
| 0.869 | 1 |
| 0.869 | 1 |
| 0.869 | 1 |
| 0.869 | 1 |
| 0.87 | 1 |
| 0.87 | 1 |
| 0.87 | 1 |
| 0.871 | 1 |
| 0.871 | 1 |
| 0.871 | 1 |
| 0.871 | 1 |
| 0.872 | 1 |
| 0.872 | 1 |
| 0.872 | 1 |
| 0.873 | 1 |
| 0.873 | 1 |
| 0.873 | 1 |
| 0.874 | 1 |
| 0.874 | 1 |
| 0.874 | 1 |
| 0.874 | 1 |
| 0.875 | 1 |
| 0.875 | 1 |
| 0.875 | 1 |
| 0.876 | 1 |
| 0.876 | 1 |
| 0.876 | 1 |
| 0.876 | 1 |
| 0.877 | 1 |
| 0.877 | 1 |
| 0.877 | 1 |
| 0.878 | 1 |
| 0.878 | 1 |
| 0.878 | 1 |
| 0.878 | 1 |
| 0.879 | 1 |
| 0.879 | 1 |
| 0.879 | 1 |
| 0.88 | 1 |
| 0.88 | 1 |
| 0.88 | 1 |
| 0.881 | 1 |
| 0.881 | 1 |
| 0.881 | 1 |
| 0.881 | 1 |
| 0.882 | 1 |
| 0.882 | 1 |
| 0.882 | 1 |
| 0.883 | 1 |
| 0.883 | 1 |
| 0.883 | 1 |
| 0.883 | 1 |
| 0.884 | 1 |
| 0.884 | 1 |
| 0.884 | 1 |
| 0.885 | 1 |
| 0.885 | 1 |
| 0.885 | 1 |
| 0.885 | 1 |
| 0.886 | 1 |
| 0.886 | 1 |
| 0.886 | 1 |
| 0.887 | 1 |
| 0.887 | 1 |
| 0.887 | 1 |
| 0.887 | 1 |
| 0.888 | 1 |
| 0.888 | 1 |
| 0.888 | 1 |
| 0.889 | 1 |
| 0.889 | 1 |
| 0.889 | 1 |
| 0.89 | 1 |
| 0.89 | 1 |
| 0.89 | 1 |
| 0.89 | 1 |
| 0.891 | 1 |
| 0.891 | 1 |
| 0.891 | 1 |
| 0.892 | 1 |
| 0.892 | 1 |
| 0.892 | 1 |
| 0.892 | 1 |
| 0.893 | 1 |
| 0.893 | 1 |
| 0.893 | 1 |
| 0.894 | 1 |
| 0.894 | 1 |
| 0.894 | 1 |
| 0.894 | 1 |
| 0.895 | 1 |
| 0.895 | 1 |
| 0.895 | 1 |
| 0.896 | 1 |
| 0.896 | 1 |
| 0.896 | 1 |
| 0.897 | 1 |
| 0.897 | 1 |
| 0.897 | 1 |
| 0.897 | 1 |
| 0.898 | 1 |
| 0.898 | 1 |
| 0.898 | 1 |
| 0.899 | 1 |
| 0.899 | 1 |
| 0.899 | 1 |
| 0.899 | 1 |
| 0.9 | 1 |
| 0.9 | 1 |
| 0.9 | 1 |
| 0.901 | 1 |
| 0.901 | 1 |
| 0.901 | 1 |
| 0.901 | 1 |
| 0.902 | 1 |
| 0.902 | 1 |
| 0.902 | 1 |
| 0.903 | 1 |
| 0.903 | 1 |
| 0.903 | 1 |
| 0.904 | 1 |
| 0.904 | 1 |
| 0.904 | 1 |
| 0.904 | 1 |
| 0.905 | 1 |
| 0.905 | 1 |
| 0.905 | 1 |
| 0.906 | 1 |
| 0.906 | 1 |
| 0.906 | 1 |
| 0.906 | 1 |
| 0.907 | 1 |
| 0.907 | 1 |
| 0.907 | 1 |
| 0.908 | 1 |
| 0.908 | 1 |
| 0.908 | 1 |
| 0.908 | 1 |
| 0.909 | 1 |
| 0.909 | 1 |
| 0.909 | 1 |
| 0.91 | 1 |
| 0.91 | 1 |
| 0.91 | 1 |
| 0.911 | 1 |
| 0.911 | 1 |
| 0.911 | 1 |
| 0.911 | 1 |
| 0.912 | 1 |
| 0.912 | 1 |
| 0.912 | 1 |
| 0.913 | 1 |
| 0.913 | 1 |
| 0.913 | 1 |
| 0.913 | 1 |
| 0.914 | 1 |
| 0.914 | 1 |
| 0.914 | 1 |
| 0.915 | 1 |
| 0.915 | 1 |
| 0.915 | 1 |
| 0.915 | 1 |
| 0.916 | 1 |
| 0.916 | 1 |
| 0.916 | 1 |
| 0.917 | 1 |
| 0.917 | 1 |
| 0.917 | 1 |
| 0.918 | 1 |
| 0.918 | 1 |
| 0.918 | 1 |
| 0.918 | 1 |
| 0.919 | 1 |
| 0.919 | 1 |
| 0.919 | 1 |
| 0.92 | 1 |
| 0.92 | 1 |
| 0.92 | 1 |
| 0.92 | 1 |
| 0.921 | 1 |
| 0.921 | 1 |
| 0.921 | 1 |
| 0.922 | 1 |
| 0.922 | 1 |
| 0.922 | 1 |
| 0.922 | 1 |
| 0.923 | 1 |
| 0.923 | 1 |
| 0.923 | 1 |
| 0.924 | 1 |
| 0.924 | 1 |
| 0.924 | 1 |
| 0.925 | 1 |
| 0.925 | 1 |
| 0.925 | 1 |
| 0.925 | 1 |
| 0.926 | 1 |
| 0.926 | 1 |
| 0.926 | 1 |
| 0.927 | 1 |
| 0.927 | 1 |
| 0.927 | 1 |
| 0.927 | 1 |
| 0.928 | 1 |
| 0.928 | 1 |
| 0.928 | 1 |
| 0.929 | 1 |
| 0.929 | 1 |
| 0.929 | 1 |
| 0.929 | 1 |
| 0.9299999999999999 | 1 |
| 0.9299999999999999 | 1 |
| 0.9299999999999999 | 1 |
| 0.931 | 1 |
| 0.931 | 1 |
| 0.931 | 1 |
| 0.9319999999999999 | 1 |
| 0.9319999999999999 | 1 |
| 0.9319999999999999 | 1 |
| 0.9319999999999999 | 1 |
| 0.933 | 1 |
| 0.933 | 1 |
| 0.933 | 1 |
| 0.9339999999999999 | 1 |
| 0.9339999999999999 | 1 |
| 0.9339999999999999 | 1 |
| 0.9339999999999999 | 1 |
| 0.935 | 1 |
| 0.935 | 1 |
| 0.935 | 1 |
| 0.9359999999999999 | 1 |
| 0.9359999999999999 | 1 |
| 0.9359999999999999 | 1 |
| 0.9359999999999999 | 1 |
| 0.937 | 1 |
| 0.937 | 1 |
| 0.937 | 1 |
| 0.938 | 1 |
| 0.938 | 1 |
| 0.938 | 1 |
| 0.9390000000000001 | 1 |
| 0.9390000000000001 | 1 |
| 0.9390000000000001 | 1 |
| 0.9390000000000001 | 1 |
| 0.94 | 1 |
| 0.94 | 1 |
| 0.94 | 1 |
| 0.9410000000000001 | 1 |
| 0.9410000000000001 | 1 |
| 0.9410000000000001 | 1 |
| 0.9410000000000001 | 1 |
| 0.942 | 1 |
| 0.942 | 1 |
| 0.942 | 1 |
| 0.943 | 1 |
| 0.943 | 1 |
| 0.943 | 1 |
| 0.943 | 1 |
| 0.944 | 1 |
| 0.944 | 1 |
| 0.944 | 1 |
| 0.945 | 1 |
| 0.945 | 1 |
| 0.945 | 1 |
| 0.945 | 1 |
| 0.946 | 1 |
| 0.946 | 1 |
| 0.946 | 1 |
| 0.947 | 1 |
| 0.947 | 1 |
| 0.947 | 1 |
| 0.948 | 1 |
| 0.948 | 1 |
| 0.948 | 1 |
| 0.948 | 1 |
| 0.949 | 1 |
| 0.949 | 1 |
| 0.949 | 1 |
| 0.95 | 1 |
| 0.95 | 1 |
| 0.95 | 1 |
| 0.95 | 1 |
| 0.951 | 1 |
| 0.951 | 1 |
| 0.951 | 1 |
| 0.952 | 1 |
| 0.952 | 1 |
| 0.952 | 1 |
| 0.952 | 1 |
| 0.953 | 1 |
| 0.953 | 1 |
| 0.953 | 1 |
| 0.954 | 1 |
| 0.954 | 1 |
| 0.954 | 1 |
| 0.955 | 1 |
| 0.955 | 1 |
| 0.955 | 1 |
| 0.955 | 1 |
| 0.956 | 1 |
| 0.956 | 1 |
| 0.956 | 1 |
| 0.957 | 1 |
| 0.957 | 1 |
| 0.957 | 1 |
| 0.957 | 1 |
| 0.958 | 1 |
| 0.958 | 1 |
| 0.958 | 1 |
| 0.959 | 1 |
| 0.959 | 1 |
| 0.959 | 1 |
| 0.959 | 1 |
| 0.96 | 1 |
| 0.96 | 1 |
| 0.96 | 1 |
| 0.961 | 1 |
| 0.961 | 1 |
| 0.961 | 1 |
| 0.962 | 1 |
| 0.962 | 1 |
| 0.962 | 1 |
| 0.962 | 1 |
| 0.963 | 1 |
| 0.963 | 1 |
| 0.963 | 1 |
| 0.964 | 1 |
| 0.964 | 1 |
| 0.964 | 1 |
| 0.964 | 1 |
| 0.965 | 1 |
| 0.965 | 1 |
| 0.965 | 1 |
| 0.966 | 1 |
| 0.966 | 1 |
| 0.966 | 1 |
| 0.966 | 1 |
| 0.967 | 1 |
| 0.967 | 1 |
| 0.967 | 1 |
| 0.968 | 1 |
| 0.968 | 1 |
| 0.968 | 1 |
| 0.969 | 1 |
| 0.969 | 1 |
| 0.969 | 1 |
| 0.969 | 1 |
| 0.97 | 1 |
| 0.97 | 1 |
| 0.97 | 1 |
| 0.971 | 1 |
| 0.971 | 1 |
| 0.971 | 1 |
| 0.971 | 1 |
| 0.972 | 1 |
| 0.972 | 1 |
| 0.972 | 1 |
| 0.973 | 1 |
| 0.973 | 1 |
| 0.973 | 1 |
| 0.973 | 1 |
| 0.974 | 1 |
| 0.974 | 1 |
| 0.974 | 1 |
| 0.975 | 1 |
| 0.975 | 1 |
| 0.975 | 1 |
| 0.976 | 1 |
| 0.976 | 1 |
| 0.976 | 1 |
| 0.976 | 1 |
| 0.977 | 1 |
| 0.977 | 1 |
| 0.977 | 1 |
| 0.978 | 1 |
| 0.978 | 1 |
| 0.978 | 1 |
| 0.978 | 1 |
| 0.979 | 1 |
| 0.979 | 1 |
| 0.979 | 1 |
| 0.98 | 1 |
| 0.98 | 1 |
| 0.98 | 1 |
| 0.98 | 1 |
| 0.981 | 1 |
| 0.981 | 1 |
| 0.981 | 1 |
| 0.982 | 1 |
| 0.982 | 1 |
| 0.982 | 1 |
| 0.983 | 1 |
| 0.983 | 1 |
| 0.983 | 1 |
| 0.983 | 1 |
| 0.984 | 1 |
| 0.984 | 1 |
| 0.984 | 1 |
| 0.985 | 1 |
| 0.985 | 1 |
| 0.985 | 1 |
| 0.985 | 1 |
| 0.986 | 1 |
| 0.986 | 1 |
| 0.986 | 1 |
| 0.987 | 1 |
| 0.987 | 1 |
| 0.987 | 1 |
| 0.987 | 1 |
| 0.988 | 1 |
| 0.988 | 1 |
| 0.988 | 1 |
| 0.989 | 1 |
| 0.989 | 1 |
| 0.989 | 1 |
| 0.99 | 1 |
| 0.99 | 1 |
| 0.99 | 1 |
| 0.99 | 1 |
| 0.991 | 1 |
| 0.991 | 1 |
| 0.991 | 1 |
| 0.992 | 1 |
| 0.992 | 1 |
| 0.992 | 1 |
| 0.992 | 1 |
| 0.993 | 1 |
| 0.993 | 1 |
| 0.993 | 1 |
| 0.994 | 1 |
| 0.994 | 1 |
| 0.994 | 1 |
| 0.994 | 1 |
| 0.995 | 1 |
| 0.995 | 1 |
| 0.995 | 1 |
| 0.996 | 1 |
| 0.996 | 1 |
| 0.996 | 1 |
| 0.997 | 1 |
| 0.997 | 1 |
| 0.997 | 1 |
| 0.997 | 1 |
| 0.998 | 1 |
| 0.998 | 1 |
| 0.998 | 1 |
| 0.999 | 1 |
| 0.999 | 1 |
| 0.999 | 1 |
| 0.999 | 1 |
| 1.0 | 1 |